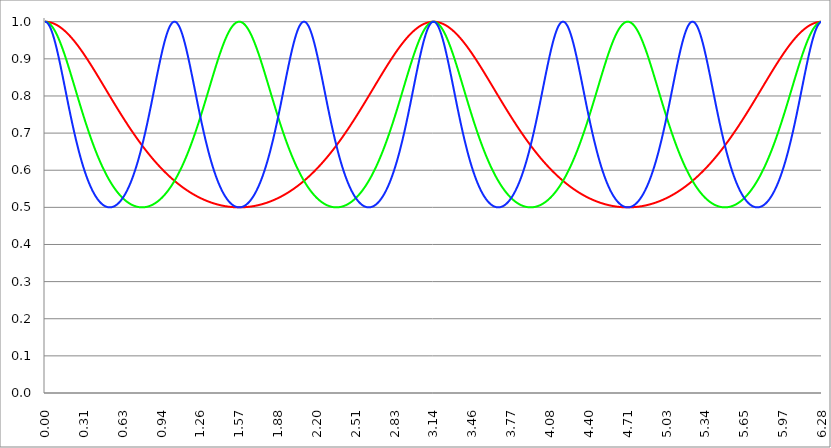
| Category | Series 1 | Series 0 | Series 2 |
|---|---|---|---|
| 0.0 | 1 | 1 | 1 |
| 0.00314159265358979 | 1 | 1 | 1 |
| 0.00628318530717958 | 1 | 1 | 1 |
| 0.00942477796076938 | 1 | 1 | 0.999 |
| 0.0125663706143592 | 1 | 0.999 | 0.999 |
| 0.015707963267949 | 1 | 0.999 | 0.998 |
| 0.0188495559215388 | 1 | 0.999 | 0.997 |
| 0.0219911485751285 | 1 | 0.998 | 0.996 |
| 0.0251327412287183 | 0.999 | 0.997 | 0.994 |
| 0.0282743338823081 | 0.999 | 0.997 | 0.993 |
| 0.0314159265358979 | 0.999 | 0.996 | 0.991 |
| 0.0345575191894877 | 0.999 | 0.995 | 0.989 |
| 0.0376991118430775 | 0.999 | 0.994 | 0.987 |
| 0.0408407044966673 | 0.998 | 0.993 | 0.985 |
| 0.0439822971502571 | 0.998 | 0.992 | 0.983 |
| 0.0471238898038469 | 0.998 | 0.991 | 0.981 |
| 0.0502654824574367 | 0.997 | 0.99 | 0.978 |
| 0.0534070751110265 | 0.997 | 0.989 | 0.975 |
| 0.0565486677646163 | 0.997 | 0.987 | 0.972 |
| 0.059690260418206 | 0.996 | 0.986 | 0.969 |
| 0.0628318530717958 | 0.996 | 0.985 | 0.966 |
| 0.0659734457253856 | 0.996 | 0.983 | 0.963 |
| 0.0691150383789754 | 0.995 | 0.981 | 0.959 |
| 0.0722566310325652 | 0.995 | 0.98 | 0.956 |
| 0.075398223686155 | 0.994 | 0.978 | 0.952 |
| 0.0785398163397448 | 0.994 | 0.976 | 0.948 |
| 0.0816814089933346 | 0.993 | 0.974 | 0.944 |
| 0.0848230016469244 | 0.993 | 0.972 | 0.94 |
| 0.0879645943005142 | 0.992 | 0.97 | 0.936 |
| 0.091106186954104 | 0.992 | 0.968 | 0.932 |
| 0.0942477796076937 | 0.991 | 0.966 | 0.928 |
| 0.0973893722612835 | 0.991 | 0.964 | 0.923 |
| 0.100530964914873 | 0.99 | 0.962 | 0.919 |
| 0.103672557568463 | 0.989 | 0.959 | 0.914 |
| 0.106814150222053 | 0.989 | 0.957 | 0.91 |
| 0.109955742875643 | 0.988 | 0.955 | 0.905 |
| 0.113097335529233 | 0.987 | 0.952 | 0.9 |
| 0.116238928182822 | 0.987 | 0.95 | 0.895 |
| 0.119380520836412 | 0.986 | 0.947 | 0.891 |
| 0.122522113490002 | 0.985 | 0.944 | 0.886 |
| 0.125663706143592 | 0.985 | 0.942 | 0.881 |
| 0.128805298797181 | 0.984 | 0.939 | 0.876 |
| 0.131946891450771 | 0.983 | 0.936 | 0.871 |
| 0.135088484104361 | 0.982 | 0.934 | 0.865 |
| 0.138230076757951 | 0.981 | 0.931 | 0.86 |
| 0.141371669411541 | 0.981 | 0.928 | 0.855 |
| 0.14451326206513 | 0.98 | 0.925 | 0.85 |
| 0.14765485471872 | 0.979 | 0.922 | 0.845 |
| 0.15079644737231 | 0.978 | 0.919 | 0.84 |
| 0.1539380400259 | 0.977 | 0.916 | 0.834 |
| 0.15707963267949 | 0.976 | 0.913 | 0.829 |
| 0.160221225333079 | 0.975 | 0.91 | 0.824 |
| 0.163362817986669 | 0.974 | 0.907 | 0.819 |
| 0.166504410640259 | 0.973 | 0.903 | 0.813 |
| 0.169646003293849 | 0.972 | 0.9 | 0.808 |
| 0.172787595947439 | 0.971 | 0.897 | 0.803 |
| 0.175929188601028 | 0.97 | 0.894 | 0.798 |
| 0.179070781254618 | 0.969 | 0.891 | 0.792 |
| 0.182212373908208 | 0.968 | 0.887 | 0.787 |
| 0.185353966561798 | 0.967 | 0.884 | 0.782 |
| 0.188495559215388 | 0.966 | 0.881 | 0.777 |
| 0.191637151868977 | 0.965 | 0.877 | 0.772 |
| 0.194778744522567 | 0.964 | 0.874 | 0.767 |
| 0.197920337176157 | 0.963 | 0.871 | 0.762 |
| 0.201061929829747 | 0.962 | 0.867 | 0.757 |
| 0.204203522483336 | 0.961 | 0.864 | 0.752 |
| 0.207345115136926 | 0.959 | 0.86 | 0.747 |
| 0.210486707790516 | 0.958 | 0.857 | 0.742 |
| 0.213628300444106 | 0.957 | 0.853 | 0.737 |
| 0.216769893097696 | 0.956 | 0.85 | 0.732 |
| 0.219911485751285 | 0.955 | 0.847 | 0.727 |
| 0.223053078404875 | 0.953 | 0.843 | 0.722 |
| 0.226194671058465 | 0.952 | 0.84 | 0.717 |
| 0.229336263712055 | 0.951 | 0.836 | 0.713 |
| 0.232477856365645 | 0.95 | 0.833 | 0.708 |
| 0.235619449019234 | 0.948 | 0.829 | 0.703 |
| 0.238761041672824 | 0.947 | 0.826 | 0.699 |
| 0.241902634326414 | 0.946 | 0.822 | 0.694 |
| 0.245044226980004 | 0.944 | 0.819 | 0.69 |
| 0.248185819633594 | 0.943 | 0.815 | 0.685 |
| 0.251327412287183 | 0.942 | 0.812 | 0.681 |
| 0.254469004940773 | 0.94 | 0.808 | 0.677 |
| 0.257610597594363 | 0.939 | 0.805 | 0.672 |
| 0.260752190247953 | 0.938 | 0.801 | 0.668 |
| 0.263893782901543 | 0.936 | 0.798 | 0.664 |
| 0.267035375555132 | 0.935 | 0.794 | 0.66 |
| 0.270176968208722 | 0.934 | 0.791 | 0.656 |
| 0.273318560862312 | 0.932 | 0.787 | 0.652 |
| 0.276460153515902 | 0.931 | 0.784 | 0.648 |
| 0.279601746169492 | 0.929 | 0.78 | 0.644 |
| 0.282743338823082 | 0.928 | 0.777 | 0.64 |
| 0.285884931476671 | 0.926 | 0.774 | 0.636 |
| 0.289026524130261 | 0.925 | 0.77 | 0.632 |
| 0.292168116783851 | 0.923 | 0.767 | 0.629 |
| 0.295309709437441 | 0.922 | 0.763 | 0.625 |
| 0.298451302091031 | 0.92 | 0.76 | 0.621 |
| 0.30159289474462 | 0.919 | 0.757 | 0.618 |
| 0.30473448739821 | 0.917 | 0.753 | 0.614 |
| 0.3078760800518 | 0.916 | 0.75 | 0.611 |
| 0.31101767270539 | 0.914 | 0.747 | 0.608 |
| 0.31415926535898 | 0.913 | 0.743 | 0.604 |
| 0.31730085801257 | 0.911 | 0.74 | 0.601 |
| 0.320442450666159 | 0.91 | 0.737 | 0.598 |
| 0.323584043319749 | 0.908 | 0.733 | 0.595 |
| 0.326725635973339 | 0.907 | 0.73 | 0.592 |
| 0.329867228626929 | 0.905 | 0.727 | 0.589 |
| 0.333008821280519 | 0.903 | 0.724 | 0.586 |
| 0.336150413934108 | 0.902 | 0.721 | 0.583 |
| 0.339292006587698 | 0.9 | 0.717 | 0.58 |
| 0.342433599241288 | 0.899 | 0.714 | 0.577 |
| 0.345575191894878 | 0.897 | 0.711 | 0.574 |
| 0.348716784548468 | 0.895 | 0.708 | 0.572 |
| 0.351858377202058 | 0.894 | 0.705 | 0.569 |
| 0.354999969855647 | 0.892 | 0.702 | 0.566 |
| 0.358141562509237 | 0.891 | 0.699 | 0.564 |
| 0.361283155162827 | 0.889 | 0.696 | 0.561 |
| 0.364424747816417 | 0.887 | 0.693 | 0.559 |
| 0.367566340470007 | 0.886 | 0.69 | 0.557 |
| 0.370707933123597 | 0.884 | 0.687 | 0.554 |
| 0.373849525777186 | 0.882 | 0.684 | 0.552 |
| 0.376991118430776 | 0.881 | 0.681 | 0.55 |
| 0.380132711084366 | 0.879 | 0.678 | 0.548 |
| 0.383274303737956 | 0.877 | 0.675 | 0.546 |
| 0.386415896391546 | 0.876 | 0.672 | 0.543 |
| 0.389557489045135 | 0.874 | 0.669 | 0.541 |
| 0.392699081698725 | 0.872 | 0.667 | 0.54 |
| 0.395840674352315 | 0.871 | 0.664 | 0.538 |
| 0.398982267005905 | 0.869 | 0.661 | 0.536 |
| 0.402123859659495 | 0.867 | 0.658 | 0.534 |
| 0.405265452313085 | 0.865 | 0.656 | 0.532 |
| 0.408407044966674 | 0.864 | 0.653 | 0.53 |
| 0.411548637620264 | 0.862 | 0.65 | 0.529 |
| 0.414690230273854 | 0.86 | 0.648 | 0.527 |
| 0.417831822927444 | 0.859 | 0.645 | 0.526 |
| 0.420973415581034 | 0.857 | 0.642 | 0.524 |
| 0.424115008234623 | 0.855 | 0.64 | 0.523 |
| 0.427256600888213 | 0.853 | 0.637 | 0.521 |
| 0.430398193541803 | 0.852 | 0.635 | 0.52 |
| 0.433539786195393 | 0.85 | 0.632 | 0.518 |
| 0.436681378848983 | 0.848 | 0.63 | 0.517 |
| 0.439822971502573 | 0.847 | 0.627 | 0.516 |
| 0.442964564156162 | 0.845 | 0.625 | 0.515 |
| 0.446106156809752 | 0.843 | 0.623 | 0.514 |
| 0.449247749463342 | 0.841 | 0.62 | 0.513 |
| 0.452389342116932 | 0.84 | 0.618 | 0.511 |
| 0.455530934770522 | 0.838 | 0.616 | 0.51 |
| 0.458672527424111 | 0.836 | 0.613 | 0.51 |
| 0.461814120077701 | 0.834 | 0.611 | 0.509 |
| 0.464955712731291 | 0.833 | 0.609 | 0.508 |
| 0.468097305384881 | 0.831 | 0.607 | 0.507 |
| 0.471238898038471 | 0.829 | 0.604 | 0.506 |
| 0.474380490692061 | 0.827 | 0.602 | 0.505 |
| 0.47752208334565 | 0.826 | 0.6 | 0.505 |
| 0.48066367599924 | 0.824 | 0.598 | 0.504 |
| 0.48380526865283 | 0.822 | 0.596 | 0.504 |
| 0.48694686130642 | 0.82 | 0.594 | 0.503 |
| 0.49008845396001 | 0.819 | 0.592 | 0.503 |
| 0.493230046613599 | 0.817 | 0.59 | 0.502 |
| 0.496371639267189 | 0.815 | 0.588 | 0.502 |
| 0.499513231920779 | 0.813 | 0.586 | 0.501 |
| 0.502654824574369 | 0.812 | 0.584 | 0.501 |
| 0.505796417227959 | 0.81 | 0.582 | 0.501 |
| 0.508938009881549 | 0.808 | 0.58 | 0.5 |
| 0.512079602535138 | 0.806 | 0.578 | 0.5 |
| 0.515221195188728 | 0.805 | 0.576 | 0.5 |
| 0.518362787842318 | 0.803 | 0.574 | 0.5 |
| 0.521504380495908 | 0.801 | 0.573 | 0.5 |
| 0.524645973149498 | 0.799 | 0.571 | 0.5 |
| 0.527787565803087 | 0.798 | 0.569 | 0.5 |
| 0.530929158456677 | 0.796 | 0.567 | 0.5 |
| 0.534070751110267 | 0.794 | 0.566 | 0.5 |
| 0.537212343763857 | 0.792 | 0.564 | 0.5 |
| 0.540353936417447 | 0.791 | 0.562 | 0.501 |
| 0.543495529071037 | 0.789 | 0.561 | 0.501 |
| 0.546637121724626 | 0.787 | 0.559 | 0.501 |
| 0.549778714378216 | 0.786 | 0.557 | 0.502 |
| 0.552920307031806 | 0.784 | 0.556 | 0.502 |
| 0.556061899685396 | 0.782 | 0.554 | 0.502 |
| 0.559203492338986 | 0.78 | 0.553 | 0.503 |
| 0.562345084992576 | 0.779 | 0.551 | 0.503 |
| 0.565486677646165 | 0.777 | 0.55 | 0.504 |
| 0.568628270299755 | 0.775 | 0.548 | 0.505 |
| 0.571769862953345 | 0.774 | 0.547 | 0.505 |
| 0.574911455606935 | 0.772 | 0.546 | 0.506 |
| 0.578053048260525 | 0.77 | 0.544 | 0.507 |
| 0.581194640914114 | 0.768 | 0.543 | 0.508 |
| 0.584336233567704 | 0.767 | 0.541 | 0.508 |
| 0.587477826221294 | 0.765 | 0.54 | 0.509 |
| 0.590619418874884 | 0.763 | 0.539 | 0.51 |
| 0.593761011528474 | 0.762 | 0.538 | 0.511 |
| 0.596902604182064 | 0.76 | 0.536 | 0.512 |
| 0.600044196835653 | 0.758 | 0.535 | 0.513 |
| 0.603185789489243 | 0.757 | 0.534 | 0.514 |
| 0.606327382142833 | 0.755 | 0.533 | 0.516 |
| 0.609468974796423 | 0.753 | 0.532 | 0.517 |
| 0.612610567450013 | 0.752 | 0.53 | 0.518 |
| 0.615752160103602 | 0.75 | 0.529 | 0.519 |
| 0.618893752757192 | 0.748 | 0.528 | 0.521 |
| 0.622035345410782 | 0.747 | 0.527 | 0.522 |
| 0.625176938064372 | 0.745 | 0.526 | 0.524 |
| 0.628318530717962 | 0.743 | 0.525 | 0.525 |
| 0.631460123371551 | 0.742 | 0.524 | 0.527 |
| 0.634601716025141 | 0.74 | 0.523 | 0.528 |
| 0.637743308678731 | 0.738 | 0.522 | 0.53 |
| 0.640884901332321 | 0.737 | 0.521 | 0.532 |
| 0.644026493985911 | 0.735 | 0.52 | 0.533 |
| 0.647168086639501 | 0.733 | 0.519 | 0.535 |
| 0.65030967929309 | 0.732 | 0.518 | 0.537 |
| 0.65345127194668 | 0.73 | 0.518 | 0.539 |
| 0.65659286460027 | 0.729 | 0.517 | 0.541 |
| 0.65973445725386 | 0.727 | 0.516 | 0.543 |
| 0.66287604990745 | 0.725 | 0.515 | 0.545 |
| 0.666017642561039 | 0.724 | 0.514 | 0.547 |
| 0.669159235214629 | 0.722 | 0.514 | 0.549 |
| 0.672300827868219 | 0.721 | 0.513 | 0.551 |
| 0.675442420521809 | 0.719 | 0.512 | 0.554 |
| 0.678584013175399 | 0.717 | 0.511 | 0.556 |
| 0.681725605828989 | 0.716 | 0.511 | 0.558 |
| 0.684867198482578 | 0.714 | 0.51 | 0.561 |
| 0.688008791136168 | 0.713 | 0.51 | 0.563 |
| 0.691150383789758 | 0.711 | 0.509 | 0.566 |
| 0.694291976443348 | 0.71 | 0.508 | 0.568 |
| 0.697433569096938 | 0.708 | 0.508 | 0.571 |
| 0.700575161750528 | 0.706 | 0.507 | 0.574 |
| 0.703716754404117 | 0.705 | 0.507 | 0.576 |
| 0.706858347057707 | 0.703 | 0.506 | 0.579 |
| 0.709999939711297 | 0.702 | 0.506 | 0.582 |
| 0.713141532364887 | 0.7 | 0.505 | 0.585 |
| 0.716283125018477 | 0.699 | 0.505 | 0.588 |
| 0.719424717672066 | 0.697 | 0.504 | 0.591 |
| 0.722566310325656 | 0.696 | 0.504 | 0.594 |
| 0.725707902979246 | 0.694 | 0.504 | 0.597 |
| 0.728849495632836 | 0.693 | 0.503 | 0.6 |
| 0.731991088286426 | 0.691 | 0.503 | 0.603 |
| 0.735132680940016 | 0.69 | 0.503 | 0.607 |
| 0.738274273593605 | 0.688 | 0.502 | 0.61 |
| 0.741415866247195 | 0.687 | 0.502 | 0.613 |
| 0.744557458900785 | 0.685 | 0.502 | 0.617 |
| 0.747699051554375 | 0.684 | 0.501 | 0.62 |
| 0.750840644207965 | 0.682 | 0.501 | 0.624 |
| 0.753982236861554 | 0.681 | 0.501 | 0.627 |
| 0.757123829515144 | 0.679 | 0.501 | 0.631 |
| 0.760265422168734 | 0.678 | 0.501 | 0.635 |
| 0.763407014822324 | 0.677 | 0.5 | 0.639 |
| 0.766548607475914 | 0.675 | 0.5 | 0.642 |
| 0.769690200129504 | 0.674 | 0.5 | 0.646 |
| 0.772831792783093 | 0.672 | 0.5 | 0.65 |
| 0.775973385436683 | 0.671 | 0.5 | 0.654 |
| 0.779114978090273 | 0.669 | 0.5 | 0.658 |
| 0.782256570743863 | 0.668 | 0.5 | 0.663 |
| 0.785398163397453 | 0.667 | 0.5 | 0.667 |
| 0.788539756051042 | 0.665 | 0.5 | 0.671 |
| 0.791681348704632 | 0.664 | 0.5 | 0.675 |
| 0.794822941358222 | 0.663 | 0.5 | 0.679 |
| 0.797964534011812 | 0.661 | 0.5 | 0.684 |
| 0.801106126665402 | 0.66 | 0.5 | 0.688 |
| 0.804247719318992 | 0.658 | 0.5 | 0.693 |
| 0.807389311972581 | 0.657 | 0.5 | 0.697 |
| 0.810530904626171 | 0.656 | 0.501 | 0.702 |
| 0.813672497279761 | 0.654 | 0.501 | 0.706 |
| 0.816814089933351 | 0.653 | 0.501 | 0.711 |
| 0.819955682586941 | 0.652 | 0.501 | 0.716 |
| 0.823097275240531 | 0.65 | 0.501 | 0.721 |
| 0.82623886789412 | 0.649 | 0.502 | 0.725 |
| 0.82938046054771 | 0.648 | 0.502 | 0.73 |
| 0.8325220532013 | 0.646 | 0.502 | 0.735 |
| 0.83566364585489 | 0.645 | 0.503 | 0.74 |
| 0.83880523850848 | 0.644 | 0.503 | 0.745 |
| 0.841946831162069 | 0.642 | 0.503 | 0.75 |
| 0.845088423815659 | 0.641 | 0.504 | 0.755 |
| 0.848230016469249 | 0.64 | 0.504 | 0.76 |
| 0.851371609122839 | 0.639 | 0.504 | 0.765 |
| 0.854513201776429 | 0.637 | 0.505 | 0.77 |
| 0.857654794430019 | 0.636 | 0.505 | 0.775 |
| 0.860796387083608 | 0.635 | 0.506 | 0.78 |
| 0.863937979737198 | 0.634 | 0.506 | 0.786 |
| 0.867079572390788 | 0.632 | 0.507 | 0.791 |
| 0.870221165044378 | 0.631 | 0.507 | 0.796 |
| 0.873362757697968 | 0.63 | 0.508 | 0.801 |
| 0.876504350351557 | 0.629 | 0.508 | 0.806 |
| 0.879645943005147 | 0.627 | 0.509 | 0.812 |
| 0.882787535658737 | 0.626 | 0.51 | 0.817 |
| 0.885929128312327 | 0.625 | 0.51 | 0.822 |
| 0.889070720965917 | 0.624 | 0.511 | 0.827 |
| 0.892212313619507 | 0.623 | 0.511 | 0.833 |
| 0.895353906273096 | 0.621 | 0.512 | 0.838 |
| 0.898495498926686 | 0.62 | 0.513 | 0.843 |
| 0.901637091580276 | 0.619 | 0.514 | 0.848 |
| 0.904778684233866 | 0.618 | 0.514 | 0.853 |
| 0.907920276887456 | 0.617 | 0.515 | 0.859 |
| 0.911061869541045 | 0.616 | 0.516 | 0.864 |
| 0.914203462194635 | 0.614 | 0.517 | 0.869 |
| 0.917345054848225 | 0.613 | 0.518 | 0.874 |
| 0.920486647501815 | 0.612 | 0.518 | 0.879 |
| 0.923628240155405 | 0.611 | 0.519 | 0.884 |
| 0.926769832808995 | 0.61 | 0.52 | 0.889 |
| 0.929911425462584 | 0.609 | 0.521 | 0.894 |
| 0.933053018116174 | 0.608 | 0.522 | 0.899 |
| 0.936194610769764 | 0.607 | 0.523 | 0.903 |
| 0.939336203423354 | 0.606 | 0.524 | 0.908 |
| 0.942477796076944 | 0.604 | 0.525 | 0.913 |
| 0.945619388730533 | 0.603 | 0.526 | 0.917 |
| 0.948760981384123 | 0.602 | 0.527 | 0.922 |
| 0.951902574037713 | 0.601 | 0.528 | 0.926 |
| 0.955044166691303 | 0.6 | 0.529 | 0.931 |
| 0.958185759344893 | 0.599 | 0.53 | 0.935 |
| 0.961327351998483 | 0.598 | 0.532 | 0.939 |
| 0.964468944652072 | 0.597 | 0.533 | 0.943 |
| 0.967610537305662 | 0.596 | 0.534 | 0.947 |
| 0.970752129959252 | 0.595 | 0.535 | 0.951 |
| 0.973893722612842 | 0.594 | 0.536 | 0.955 |
| 0.977035315266432 | 0.593 | 0.538 | 0.958 |
| 0.980176907920022 | 0.592 | 0.539 | 0.962 |
| 0.983318500573611 | 0.591 | 0.54 | 0.965 |
| 0.986460093227201 | 0.59 | 0.541 | 0.968 |
| 0.989601685880791 | 0.589 | 0.543 | 0.971 |
| 0.992743278534381 | 0.588 | 0.544 | 0.974 |
| 0.995884871187971 | 0.587 | 0.546 | 0.977 |
| 0.99902646384156 | 0.586 | 0.547 | 0.98 |
| 1.00216805649515 | 0.585 | 0.548 | 0.982 |
| 1.00530964914874 | 0.584 | 0.55 | 0.985 |
| 1.00845124180233 | 0.583 | 0.551 | 0.987 |
| 1.01159283445592 | 0.582 | 0.553 | 0.989 |
| 1.01473442710951 | 0.581 | 0.554 | 0.991 |
| 1.017876019763099 | 0.58 | 0.556 | 0.992 |
| 1.021017612416689 | 0.579 | 0.557 | 0.994 |
| 1.02415920507028 | 0.578 | 0.559 | 0.995 |
| 1.027300797723869 | 0.577 | 0.561 | 0.996 |
| 1.030442390377459 | 0.576 | 0.562 | 0.997 |
| 1.033583983031048 | 0.575 | 0.564 | 0.998 |
| 1.036725575684638 | 0.574 | 0.566 | 0.999 |
| 1.039867168338228 | 0.574 | 0.567 | 1 |
| 1.043008760991818 | 0.573 | 0.569 | 1 |
| 1.046150353645408 | 0.572 | 0.571 | 1 |
| 1.049291946298998 | 0.571 | 0.573 | 1 |
| 1.052433538952587 | 0.57 | 0.574 | 1 |
| 1.055575131606177 | 0.569 | 0.576 | 0.999 |
| 1.058716724259767 | 0.568 | 0.578 | 0.999 |
| 1.061858316913357 | 0.567 | 0.58 | 0.998 |
| 1.064999909566947 | 0.566 | 0.582 | 0.997 |
| 1.068141502220536 | 0.566 | 0.584 | 0.996 |
| 1.071283094874126 | 0.565 | 0.586 | 0.995 |
| 1.074424687527716 | 0.564 | 0.588 | 0.993 |
| 1.077566280181306 | 0.563 | 0.59 | 0.992 |
| 1.080707872834896 | 0.562 | 0.592 | 0.99 |
| 1.083849465488486 | 0.561 | 0.594 | 0.988 |
| 1.086991058142075 | 0.561 | 0.596 | 0.986 |
| 1.090132650795665 | 0.56 | 0.598 | 0.984 |
| 1.093274243449255 | 0.559 | 0.6 | 0.981 |
| 1.096415836102845 | 0.558 | 0.602 | 0.979 |
| 1.099557428756435 | 0.557 | 0.604 | 0.976 |
| 1.102699021410025 | 0.557 | 0.607 | 0.973 |
| 1.105840614063614 | 0.556 | 0.609 | 0.97 |
| 1.108982206717204 | 0.555 | 0.611 | 0.967 |
| 1.112123799370794 | 0.554 | 0.613 | 0.964 |
| 1.115265392024384 | 0.554 | 0.616 | 0.961 |
| 1.118406984677974 | 0.553 | 0.618 | 0.957 |
| 1.121548577331563 | 0.552 | 0.62 | 0.953 |
| 1.124690169985153 | 0.551 | 0.623 | 0.95 |
| 1.127831762638743 | 0.551 | 0.625 | 0.946 |
| 1.130973355292333 | 0.55 | 0.627 | 0.942 |
| 1.134114947945923 | 0.549 | 0.63 | 0.938 |
| 1.137256540599513 | 0.548 | 0.632 | 0.934 |
| 1.140398133253102 | 0.548 | 0.635 | 0.929 |
| 1.143539725906692 | 0.547 | 0.637 | 0.925 |
| 1.146681318560282 | 0.546 | 0.64 | 0.92 |
| 1.149822911213872 | 0.546 | 0.642 | 0.916 |
| 1.152964503867462 | 0.545 | 0.645 | 0.911 |
| 1.156106096521051 | 0.544 | 0.648 | 0.907 |
| 1.159247689174641 | 0.543 | 0.65 | 0.902 |
| 1.162389281828231 | 0.543 | 0.653 | 0.897 |
| 1.165530874481821 | 0.542 | 0.656 | 0.892 |
| 1.168672467135411 | 0.541 | 0.658 | 0.887 |
| 1.171814059789001 | 0.541 | 0.661 | 0.882 |
| 1.17495565244259 | 0.54 | 0.664 | 0.877 |
| 1.17809724509618 | 0.54 | 0.667 | 0.872 |
| 1.18123883774977 | 0.539 | 0.669 | 0.867 |
| 1.18438043040336 | 0.538 | 0.672 | 0.862 |
| 1.18752202305695 | 0.538 | 0.675 | 0.857 |
| 1.190663615710539 | 0.537 | 0.678 | 0.852 |
| 1.193805208364129 | 0.536 | 0.681 | 0.847 |
| 1.19694680101772 | 0.536 | 0.684 | 0.841 |
| 1.200088393671309 | 0.535 | 0.687 | 0.836 |
| 1.203229986324899 | 0.535 | 0.69 | 0.831 |
| 1.206371578978489 | 0.534 | 0.693 | 0.826 |
| 1.209513171632078 | 0.533 | 0.696 | 0.82 |
| 1.212654764285668 | 0.533 | 0.699 | 0.815 |
| 1.215796356939258 | 0.532 | 0.702 | 0.81 |
| 1.218937949592848 | 0.532 | 0.705 | 0.805 |
| 1.222079542246438 | 0.531 | 0.708 | 0.799 |
| 1.225221134900027 | 0.53 | 0.711 | 0.794 |
| 1.228362727553617 | 0.53 | 0.714 | 0.789 |
| 1.231504320207207 | 0.529 | 0.717 | 0.784 |
| 1.234645912860797 | 0.529 | 0.721 | 0.779 |
| 1.237787505514387 | 0.528 | 0.724 | 0.774 |
| 1.240929098167977 | 0.528 | 0.727 | 0.768 |
| 1.244070690821566 | 0.527 | 0.73 | 0.763 |
| 1.247212283475156 | 0.527 | 0.733 | 0.758 |
| 1.250353876128746 | 0.526 | 0.737 | 0.753 |
| 1.253495468782336 | 0.526 | 0.74 | 0.748 |
| 1.256637061435926 | 0.525 | 0.743 | 0.743 |
| 1.259778654089515 | 0.525 | 0.747 | 0.738 |
| 1.262920246743105 | 0.524 | 0.75 | 0.733 |
| 1.266061839396695 | 0.524 | 0.753 | 0.729 |
| 1.269203432050285 | 0.523 | 0.757 | 0.724 |
| 1.272345024703875 | 0.523 | 0.76 | 0.719 |
| 1.275486617357465 | 0.522 | 0.763 | 0.714 |
| 1.278628210011054 | 0.522 | 0.767 | 0.71 |
| 1.281769802664644 | 0.521 | 0.77 | 0.705 |
| 1.284911395318234 | 0.521 | 0.774 | 0.7 |
| 1.288052987971824 | 0.52 | 0.777 | 0.696 |
| 1.291194580625414 | 0.52 | 0.78 | 0.691 |
| 1.294336173279003 | 0.519 | 0.784 | 0.687 |
| 1.297477765932593 | 0.519 | 0.787 | 0.682 |
| 1.300619358586183 | 0.518 | 0.791 | 0.678 |
| 1.303760951239773 | 0.518 | 0.794 | 0.674 |
| 1.306902543893363 | 0.518 | 0.798 | 0.669 |
| 1.310044136546953 | 0.517 | 0.801 | 0.665 |
| 1.313185729200542 | 0.517 | 0.805 | 0.661 |
| 1.316327321854132 | 0.516 | 0.808 | 0.657 |
| 1.319468914507722 | 0.516 | 0.812 | 0.653 |
| 1.322610507161312 | 0.516 | 0.815 | 0.649 |
| 1.325752099814902 | 0.515 | 0.819 | 0.645 |
| 1.328893692468491 | 0.515 | 0.822 | 0.641 |
| 1.332035285122081 | 0.514 | 0.826 | 0.637 |
| 1.335176877775671 | 0.514 | 0.829 | 0.634 |
| 1.338318470429261 | 0.514 | 0.833 | 0.63 |
| 1.341460063082851 | 0.513 | 0.836 | 0.626 |
| 1.344601655736441 | 0.513 | 0.84 | 0.623 |
| 1.34774324839003 | 0.513 | 0.843 | 0.619 |
| 1.35088484104362 | 0.512 | 0.847 | 0.616 |
| 1.35402643369721 | 0.512 | 0.85 | 0.612 |
| 1.3571680263508 | 0.511 | 0.853 | 0.609 |
| 1.36030961900439 | 0.511 | 0.857 | 0.606 |
| 1.363451211657979 | 0.511 | 0.86 | 0.602 |
| 1.36659280431157 | 0.51 | 0.864 | 0.599 |
| 1.369734396965159 | 0.51 | 0.867 | 0.596 |
| 1.372875989618749 | 0.51 | 0.871 | 0.593 |
| 1.376017582272339 | 0.51 | 0.874 | 0.59 |
| 1.379159174925929 | 0.509 | 0.877 | 0.587 |
| 1.382300767579518 | 0.509 | 0.881 | 0.584 |
| 1.385442360233108 | 0.509 | 0.884 | 0.581 |
| 1.388583952886698 | 0.508 | 0.887 | 0.578 |
| 1.391725545540288 | 0.508 | 0.891 | 0.575 |
| 1.394867138193878 | 0.508 | 0.894 | 0.573 |
| 1.398008730847468 | 0.508 | 0.897 | 0.57 |
| 1.401150323501057 | 0.507 | 0.9 | 0.567 |
| 1.404291916154647 | 0.507 | 0.903 | 0.565 |
| 1.407433508808237 | 0.507 | 0.907 | 0.562 |
| 1.410575101461827 | 0.506 | 0.91 | 0.56 |
| 1.413716694115417 | 0.506 | 0.913 | 0.557 |
| 1.416858286769006 | 0.506 | 0.916 | 0.555 |
| 1.419999879422596 | 0.506 | 0.919 | 0.553 |
| 1.423141472076186 | 0.505 | 0.922 | 0.551 |
| 1.426283064729776 | 0.505 | 0.925 | 0.548 |
| 1.429424657383366 | 0.505 | 0.928 | 0.546 |
| 1.432566250036956 | 0.505 | 0.931 | 0.544 |
| 1.435707842690545 | 0.505 | 0.934 | 0.542 |
| 1.438849435344135 | 0.504 | 0.936 | 0.54 |
| 1.441991027997725 | 0.504 | 0.939 | 0.538 |
| 1.445132620651315 | 0.504 | 0.942 | 0.536 |
| 1.448274213304905 | 0.504 | 0.944 | 0.535 |
| 1.451415805958494 | 0.504 | 0.947 | 0.533 |
| 1.454557398612084 | 0.503 | 0.95 | 0.531 |
| 1.457698991265674 | 0.503 | 0.952 | 0.529 |
| 1.460840583919264 | 0.503 | 0.955 | 0.528 |
| 1.463982176572854 | 0.503 | 0.957 | 0.526 |
| 1.467123769226444 | 0.503 | 0.959 | 0.525 |
| 1.470265361880033 | 0.503 | 0.962 | 0.523 |
| 1.473406954533623 | 0.502 | 0.964 | 0.522 |
| 1.476548547187213 | 0.502 | 0.966 | 0.52 |
| 1.479690139840803 | 0.502 | 0.968 | 0.519 |
| 1.482831732494393 | 0.502 | 0.97 | 0.518 |
| 1.485973325147982 | 0.502 | 0.972 | 0.516 |
| 1.489114917801572 | 0.502 | 0.974 | 0.515 |
| 1.492256510455162 | 0.502 | 0.976 | 0.514 |
| 1.495398103108752 | 0.501 | 0.978 | 0.513 |
| 1.498539695762342 | 0.501 | 0.98 | 0.512 |
| 1.501681288415932 | 0.501 | 0.981 | 0.511 |
| 1.504822881069521 | 0.501 | 0.983 | 0.51 |
| 1.507964473723111 | 0.501 | 0.985 | 0.509 |
| 1.511106066376701 | 0.501 | 0.986 | 0.508 |
| 1.514247659030291 | 0.501 | 0.987 | 0.507 |
| 1.517389251683881 | 0.501 | 0.989 | 0.506 |
| 1.520530844337471 | 0.501 | 0.99 | 0.506 |
| 1.52367243699106 | 0.501 | 0.991 | 0.505 |
| 1.52681402964465 | 0.5 | 0.992 | 0.504 |
| 1.52995562229824 | 0.5 | 0.993 | 0.504 |
| 1.53309721495183 | 0.5 | 0.994 | 0.503 |
| 1.53623880760542 | 0.5 | 0.995 | 0.503 |
| 1.539380400259009 | 0.5 | 0.996 | 0.502 |
| 1.542521992912599 | 0.5 | 0.997 | 0.502 |
| 1.545663585566189 | 0.5 | 0.997 | 0.501 |
| 1.548805178219779 | 0.5 | 0.998 | 0.501 |
| 1.551946770873369 | 0.5 | 0.999 | 0.501 |
| 1.555088363526959 | 0.5 | 0.999 | 0.501 |
| 1.558229956180548 | 0.5 | 0.999 | 0.5 |
| 1.561371548834138 | 0.5 | 1 | 0.5 |
| 1.564513141487728 | 0.5 | 1 | 0.5 |
| 1.567654734141318 | 0.5 | 1 | 0.5 |
| 1.570796326794908 | 0.5 | 1 | 0.5 |
| 1.573937919448497 | 0.5 | 1 | 0.5 |
| 1.577079512102087 | 0.5 | 1 | 0.5 |
| 1.580221104755677 | 0.5 | 1 | 0.5 |
| 1.583362697409267 | 0.5 | 0.999 | 0.5 |
| 1.586504290062857 | 0.5 | 0.999 | 0.501 |
| 1.589645882716447 | 0.5 | 0.999 | 0.501 |
| 1.592787475370036 | 0.5 | 0.998 | 0.501 |
| 1.595929068023626 | 0.5 | 0.997 | 0.501 |
| 1.599070660677216 | 0.5 | 0.997 | 0.502 |
| 1.602212253330806 | 0.5 | 0.996 | 0.502 |
| 1.605353845984396 | 0.5 | 0.995 | 0.503 |
| 1.608495438637985 | 0.5 | 0.994 | 0.503 |
| 1.611637031291575 | 0.5 | 0.993 | 0.504 |
| 1.614778623945165 | 0.5 | 0.992 | 0.504 |
| 1.617920216598755 | 0.501 | 0.991 | 0.505 |
| 1.621061809252345 | 0.501 | 0.99 | 0.506 |
| 1.624203401905935 | 0.501 | 0.989 | 0.506 |
| 1.627344994559524 | 0.501 | 0.987 | 0.507 |
| 1.630486587213114 | 0.501 | 0.986 | 0.508 |
| 1.633628179866704 | 0.501 | 0.985 | 0.509 |
| 1.636769772520294 | 0.501 | 0.983 | 0.51 |
| 1.639911365173884 | 0.501 | 0.981 | 0.511 |
| 1.643052957827473 | 0.501 | 0.98 | 0.512 |
| 1.646194550481063 | 0.501 | 0.978 | 0.513 |
| 1.649336143134653 | 0.502 | 0.976 | 0.514 |
| 1.652477735788243 | 0.502 | 0.974 | 0.515 |
| 1.655619328441833 | 0.502 | 0.972 | 0.516 |
| 1.658760921095423 | 0.502 | 0.97 | 0.518 |
| 1.661902513749012 | 0.502 | 0.968 | 0.519 |
| 1.665044106402602 | 0.502 | 0.966 | 0.52 |
| 1.668185699056192 | 0.502 | 0.964 | 0.522 |
| 1.671327291709782 | 0.503 | 0.962 | 0.523 |
| 1.674468884363372 | 0.503 | 0.959 | 0.525 |
| 1.677610477016961 | 0.503 | 0.957 | 0.526 |
| 1.680752069670551 | 0.503 | 0.955 | 0.528 |
| 1.683893662324141 | 0.503 | 0.952 | 0.529 |
| 1.687035254977731 | 0.503 | 0.95 | 0.531 |
| 1.690176847631321 | 0.504 | 0.947 | 0.533 |
| 1.693318440284911 | 0.504 | 0.944 | 0.535 |
| 1.6964600329385 | 0.504 | 0.942 | 0.536 |
| 1.69960162559209 | 0.504 | 0.939 | 0.538 |
| 1.70274321824568 | 0.504 | 0.936 | 0.54 |
| 1.70588481089927 | 0.505 | 0.934 | 0.542 |
| 1.70902640355286 | 0.505 | 0.931 | 0.544 |
| 1.712167996206449 | 0.505 | 0.928 | 0.546 |
| 1.715309588860039 | 0.505 | 0.925 | 0.548 |
| 1.71845118151363 | 0.505 | 0.922 | 0.551 |
| 1.721592774167219 | 0.506 | 0.919 | 0.553 |
| 1.724734366820809 | 0.506 | 0.916 | 0.555 |
| 1.727875959474399 | 0.506 | 0.913 | 0.557 |
| 1.731017552127988 | 0.506 | 0.91 | 0.56 |
| 1.734159144781578 | 0.507 | 0.907 | 0.562 |
| 1.737300737435168 | 0.507 | 0.903 | 0.565 |
| 1.740442330088758 | 0.507 | 0.9 | 0.567 |
| 1.743583922742348 | 0.508 | 0.897 | 0.57 |
| 1.746725515395937 | 0.508 | 0.894 | 0.573 |
| 1.749867108049527 | 0.508 | 0.891 | 0.575 |
| 1.753008700703117 | 0.508 | 0.887 | 0.578 |
| 1.756150293356707 | 0.509 | 0.884 | 0.581 |
| 1.759291886010297 | 0.509 | 0.881 | 0.584 |
| 1.762433478663887 | 0.509 | 0.877 | 0.587 |
| 1.765575071317476 | 0.51 | 0.874 | 0.59 |
| 1.768716663971066 | 0.51 | 0.871 | 0.593 |
| 1.771858256624656 | 0.51 | 0.867 | 0.596 |
| 1.774999849278246 | 0.51 | 0.864 | 0.599 |
| 1.778141441931836 | 0.511 | 0.86 | 0.602 |
| 1.781283034585426 | 0.511 | 0.857 | 0.606 |
| 1.784424627239015 | 0.511 | 0.853 | 0.609 |
| 1.787566219892605 | 0.512 | 0.85 | 0.612 |
| 1.790707812546195 | 0.512 | 0.847 | 0.616 |
| 1.793849405199785 | 0.513 | 0.843 | 0.619 |
| 1.796990997853375 | 0.513 | 0.84 | 0.623 |
| 1.800132590506964 | 0.513 | 0.836 | 0.626 |
| 1.803274183160554 | 0.514 | 0.833 | 0.63 |
| 1.806415775814144 | 0.514 | 0.829 | 0.634 |
| 1.809557368467734 | 0.514 | 0.826 | 0.637 |
| 1.812698961121324 | 0.515 | 0.822 | 0.641 |
| 1.815840553774914 | 0.515 | 0.819 | 0.645 |
| 1.818982146428503 | 0.516 | 0.815 | 0.649 |
| 1.822123739082093 | 0.516 | 0.812 | 0.653 |
| 1.825265331735683 | 0.516 | 0.808 | 0.657 |
| 1.828406924389273 | 0.517 | 0.805 | 0.661 |
| 1.831548517042863 | 0.517 | 0.801 | 0.665 |
| 1.834690109696452 | 0.518 | 0.798 | 0.669 |
| 1.837831702350042 | 0.518 | 0.794 | 0.674 |
| 1.840973295003632 | 0.518 | 0.791 | 0.678 |
| 1.844114887657222 | 0.519 | 0.787 | 0.682 |
| 1.847256480310812 | 0.519 | 0.784 | 0.687 |
| 1.850398072964402 | 0.52 | 0.78 | 0.691 |
| 1.853539665617991 | 0.52 | 0.777 | 0.696 |
| 1.856681258271581 | 0.521 | 0.774 | 0.7 |
| 1.859822850925171 | 0.521 | 0.77 | 0.705 |
| 1.862964443578761 | 0.522 | 0.767 | 0.71 |
| 1.866106036232351 | 0.522 | 0.763 | 0.714 |
| 1.86924762888594 | 0.523 | 0.76 | 0.719 |
| 1.87238922153953 | 0.523 | 0.757 | 0.724 |
| 1.87553081419312 | 0.524 | 0.753 | 0.729 |
| 1.87867240684671 | 0.524 | 0.75 | 0.733 |
| 1.8818139995003 | 0.525 | 0.747 | 0.738 |
| 1.88495559215389 | 0.525 | 0.743 | 0.743 |
| 1.888097184807479 | 0.526 | 0.74 | 0.748 |
| 1.891238777461069 | 0.526 | 0.737 | 0.753 |
| 1.89438037011466 | 0.527 | 0.733 | 0.758 |
| 1.897521962768249 | 0.527 | 0.73 | 0.763 |
| 1.900663555421839 | 0.528 | 0.727 | 0.768 |
| 1.903805148075429 | 0.528 | 0.724 | 0.774 |
| 1.906946740729018 | 0.529 | 0.721 | 0.779 |
| 1.910088333382608 | 0.529 | 0.717 | 0.784 |
| 1.913229926036198 | 0.53 | 0.714 | 0.789 |
| 1.916371518689788 | 0.53 | 0.711 | 0.794 |
| 1.919513111343378 | 0.531 | 0.708 | 0.799 |
| 1.922654703996967 | 0.532 | 0.705 | 0.805 |
| 1.925796296650557 | 0.532 | 0.702 | 0.81 |
| 1.928937889304147 | 0.533 | 0.699 | 0.815 |
| 1.932079481957737 | 0.533 | 0.696 | 0.82 |
| 1.935221074611327 | 0.534 | 0.693 | 0.826 |
| 1.938362667264917 | 0.535 | 0.69 | 0.831 |
| 1.941504259918506 | 0.535 | 0.687 | 0.836 |
| 1.944645852572096 | 0.536 | 0.684 | 0.841 |
| 1.947787445225686 | 0.536 | 0.681 | 0.847 |
| 1.950929037879276 | 0.537 | 0.678 | 0.852 |
| 1.954070630532866 | 0.538 | 0.675 | 0.857 |
| 1.957212223186455 | 0.538 | 0.672 | 0.862 |
| 1.960353815840045 | 0.539 | 0.669 | 0.867 |
| 1.963495408493635 | 0.54 | 0.667 | 0.872 |
| 1.966637001147225 | 0.54 | 0.664 | 0.877 |
| 1.969778593800815 | 0.541 | 0.661 | 0.882 |
| 1.972920186454405 | 0.541 | 0.658 | 0.887 |
| 1.976061779107994 | 0.542 | 0.656 | 0.892 |
| 1.979203371761584 | 0.543 | 0.653 | 0.897 |
| 1.982344964415174 | 0.543 | 0.65 | 0.902 |
| 1.985486557068764 | 0.544 | 0.648 | 0.907 |
| 1.988628149722354 | 0.545 | 0.645 | 0.911 |
| 1.991769742375943 | 0.546 | 0.642 | 0.916 |
| 1.994911335029533 | 0.546 | 0.64 | 0.92 |
| 1.998052927683123 | 0.547 | 0.637 | 0.925 |
| 2.001194520336712 | 0.548 | 0.635 | 0.929 |
| 2.004336112990302 | 0.548 | 0.632 | 0.934 |
| 2.007477705643892 | 0.549 | 0.63 | 0.938 |
| 2.010619298297482 | 0.55 | 0.627 | 0.942 |
| 2.013760890951071 | 0.551 | 0.625 | 0.946 |
| 2.016902483604661 | 0.551 | 0.623 | 0.95 |
| 2.02004407625825 | 0.552 | 0.62 | 0.953 |
| 2.02318566891184 | 0.553 | 0.618 | 0.957 |
| 2.02632726156543 | 0.554 | 0.616 | 0.961 |
| 2.029468854219019 | 0.554 | 0.613 | 0.964 |
| 2.032610446872609 | 0.555 | 0.611 | 0.967 |
| 2.035752039526198 | 0.556 | 0.609 | 0.97 |
| 2.038893632179788 | 0.557 | 0.607 | 0.973 |
| 2.042035224833378 | 0.557 | 0.604 | 0.976 |
| 2.045176817486967 | 0.558 | 0.602 | 0.979 |
| 2.048318410140557 | 0.559 | 0.6 | 0.981 |
| 2.051460002794146 | 0.56 | 0.598 | 0.984 |
| 2.054601595447736 | 0.561 | 0.596 | 0.986 |
| 2.057743188101325 | 0.561 | 0.594 | 0.988 |
| 2.060884780754915 | 0.562 | 0.592 | 0.99 |
| 2.064026373408505 | 0.563 | 0.59 | 0.992 |
| 2.067167966062094 | 0.564 | 0.588 | 0.993 |
| 2.070309558715684 | 0.565 | 0.586 | 0.995 |
| 2.073451151369273 | 0.566 | 0.584 | 0.996 |
| 2.076592744022863 | 0.566 | 0.582 | 0.997 |
| 2.079734336676452 | 0.567 | 0.58 | 0.998 |
| 2.082875929330042 | 0.568 | 0.578 | 0.999 |
| 2.086017521983632 | 0.569 | 0.576 | 0.999 |
| 2.089159114637221 | 0.57 | 0.574 | 1 |
| 2.092300707290811 | 0.571 | 0.573 | 1 |
| 2.095442299944401 | 0.572 | 0.571 | 1 |
| 2.09858389259799 | 0.573 | 0.569 | 1 |
| 2.10172548525158 | 0.574 | 0.567 | 1 |
| 2.104867077905169 | 0.574 | 0.566 | 0.999 |
| 2.108008670558759 | 0.575 | 0.564 | 0.998 |
| 2.111150263212349 | 0.576 | 0.562 | 0.997 |
| 2.114291855865938 | 0.577 | 0.561 | 0.996 |
| 2.117433448519528 | 0.578 | 0.559 | 0.995 |
| 2.120575041173117 | 0.579 | 0.557 | 0.994 |
| 2.123716633826707 | 0.58 | 0.556 | 0.992 |
| 2.126858226480297 | 0.581 | 0.554 | 0.991 |
| 2.129999819133886 | 0.582 | 0.553 | 0.989 |
| 2.133141411787476 | 0.583 | 0.551 | 0.987 |
| 2.136283004441065 | 0.584 | 0.55 | 0.985 |
| 2.139424597094655 | 0.585 | 0.548 | 0.982 |
| 2.142566189748245 | 0.586 | 0.547 | 0.98 |
| 2.145707782401834 | 0.587 | 0.546 | 0.977 |
| 2.148849375055424 | 0.588 | 0.544 | 0.974 |
| 2.151990967709013 | 0.589 | 0.543 | 0.971 |
| 2.155132560362603 | 0.59 | 0.541 | 0.968 |
| 2.158274153016193 | 0.591 | 0.54 | 0.965 |
| 2.161415745669782 | 0.592 | 0.539 | 0.962 |
| 2.164557338323372 | 0.593 | 0.538 | 0.958 |
| 2.167698930976961 | 0.594 | 0.536 | 0.955 |
| 2.170840523630551 | 0.595 | 0.535 | 0.951 |
| 2.173982116284141 | 0.596 | 0.534 | 0.947 |
| 2.17712370893773 | 0.597 | 0.533 | 0.943 |
| 2.18026530159132 | 0.598 | 0.532 | 0.939 |
| 2.183406894244909 | 0.599 | 0.53 | 0.935 |
| 2.186548486898499 | 0.6 | 0.529 | 0.931 |
| 2.189690079552089 | 0.601 | 0.528 | 0.926 |
| 2.192831672205678 | 0.602 | 0.527 | 0.922 |
| 2.195973264859268 | 0.603 | 0.526 | 0.917 |
| 2.199114857512857 | 0.604 | 0.525 | 0.913 |
| 2.202256450166447 | 0.606 | 0.524 | 0.908 |
| 2.205398042820036 | 0.607 | 0.523 | 0.903 |
| 2.208539635473626 | 0.608 | 0.522 | 0.899 |
| 2.211681228127216 | 0.609 | 0.521 | 0.894 |
| 2.214822820780805 | 0.61 | 0.52 | 0.889 |
| 2.217964413434395 | 0.611 | 0.519 | 0.884 |
| 2.221106006087984 | 0.612 | 0.518 | 0.879 |
| 2.224247598741574 | 0.613 | 0.518 | 0.874 |
| 2.227389191395164 | 0.614 | 0.517 | 0.869 |
| 2.230530784048753 | 0.616 | 0.516 | 0.864 |
| 2.233672376702343 | 0.617 | 0.515 | 0.859 |
| 2.236813969355933 | 0.618 | 0.514 | 0.853 |
| 2.239955562009522 | 0.619 | 0.514 | 0.848 |
| 2.243097154663112 | 0.62 | 0.513 | 0.843 |
| 2.246238747316701 | 0.621 | 0.512 | 0.838 |
| 2.249380339970291 | 0.623 | 0.511 | 0.833 |
| 2.252521932623881 | 0.624 | 0.511 | 0.827 |
| 2.25566352527747 | 0.625 | 0.51 | 0.822 |
| 2.25880511793106 | 0.626 | 0.51 | 0.817 |
| 2.261946710584649 | 0.627 | 0.509 | 0.812 |
| 2.265088303238239 | 0.629 | 0.508 | 0.806 |
| 2.268229895891829 | 0.63 | 0.508 | 0.801 |
| 2.271371488545418 | 0.631 | 0.507 | 0.796 |
| 2.274513081199008 | 0.632 | 0.507 | 0.791 |
| 2.277654673852597 | 0.634 | 0.506 | 0.786 |
| 2.280796266506186 | 0.635 | 0.506 | 0.78 |
| 2.283937859159776 | 0.636 | 0.505 | 0.775 |
| 2.287079451813366 | 0.637 | 0.505 | 0.77 |
| 2.290221044466955 | 0.639 | 0.504 | 0.765 |
| 2.293362637120545 | 0.64 | 0.504 | 0.76 |
| 2.296504229774135 | 0.641 | 0.504 | 0.755 |
| 2.299645822427724 | 0.642 | 0.503 | 0.75 |
| 2.302787415081314 | 0.644 | 0.503 | 0.745 |
| 2.305929007734904 | 0.645 | 0.503 | 0.74 |
| 2.309070600388493 | 0.646 | 0.502 | 0.735 |
| 2.312212193042083 | 0.648 | 0.502 | 0.73 |
| 2.315353785695672 | 0.649 | 0.502 | 0.725 |
| 2.318495378349262 | 0.65 | 0.501 | 0.721 |
| 2.321636971002852 | 0.652 | 0.501 | 0.716 |
| 2.324778563656441 | 0.653 | 0.501 | 0.711 |
| 2.327920156310031 | 0.654 | 0.501 | 0.706 |
| 2.33106174896362 | 0.656 | 0.501 | 0.702 |
| 2.33420334161721 | 0.657 | 0.5 | 0.697 |
| 2.3373449342708 | 0.658 | 0.5 | 0.693 |
| 2.340486526924389 | 0.66 | 0.5 | 0.688 |
| 2.343628119577979 | 0.661 | 0.5 | 0.684 |
| 2.346769712231568 | 0.663 | 0.5 | 0.679 |
| 2.349911304885158 | 0.664 | 0.5 | 0.675 |
| 2.353052897538748 | 0.665 | 0.5 | 0.671 |
| 2.356194490192337 | 0.667 | 0.5 | 0.667 |
| 2.359336082845927 | 0.668 | 0.5 | 0.663 |
| 2.362477675499516 | 0.669 | 0.5 | 0.658 |
| 2.365619268153106 | 0.671 | 0.5 | 0.654 |
| 2.368760860806696 | 0.672 | 0.5 | 0.65 |
| 2.371902453460285 | 0.674 | 0.5 | 0.646 |
| 2.375044046113875 | 0.675 | 0.5 | 0.642 |
| 2.378185638767464 | 0.677 | 0.5 | 0.639 |
| 2.381327231421054 | 0.678 | 0.501 | 0.635 |
| 2.384468824074644 | 0.679 | 0.501 | 0.631 |
| 2.387610416728233 | 0.681 | 0.501 | 0.627 |
| 2.390752009381823 | 0.682 | 0.501 | 0.624 |
| 2.393893602035412 | 0.684 | 0.501 | 0.62 |
| 2.397035194689002 | 0.685 | 0.502 | 0.617 |
| 2.400176787342591 | 0.687 | 0.502 | 0.613 |
| 2.403318379996181 | 0.688 | 0.502 | 0.61 |
| 2.406459972649771 | 0.69 | 0.503 | 0.607 |
| 2.40960156530336 | 0.691 | 0.503 | 0.603 |
| 2.41274315795695 | 0.693 | 0.503 | 0.6 |
| 2.41588475061054 | 0.694 | 0.504 | 0.597 |
| 2.419026343264129 | 0.696 | 0.504 | 0.594 |
| 2.422167935917719 | 0.697 | 0.504 | 0.591 |
| 2.425309528571308 | 0.699 | 0.505 | 0.588 |
| 2.428451121224898 | 0.7 | 0.505 | 0.585 |
| 2.431592713878488 | 0.702 | 0.506 | 0.582 |
| 2.434734306532077 | 0.703 | 0.506 | 0.579 |
| 2.437875899185667 | 0.705 | 0.507 | 0.576 |
| 2.441017491839256 | 0.706 | 0.507 | 0.574 |
| 2.444159084492846 | 0.708 | 0.508 | 0.571 |
| 2.447300677146435 | 0.71 | 0.508 | 0.568 |
| 2.450442269800025 | 0.711 | 0.509 | 0.566 |
| 2.453583862453615 | 0.713 | 0.51 | 0.563 |
| 2.456725455107204 | 0.714 | 0.51 | 0.561 |
| 2.459867047760794 | 0.716 | 0.511 | 0.558 |
| 2.463008640414384 | 0.717 | 0.511 | 0.556 |
| 2.466150233067973 | 0.719 | 0.512 | 0.554 |
| 2.469291825721563 | 0.721 | 0.513 | 0.551 |
| 2.472433418375152 | 0.722 | 0.514 | 0.549 |
| 2.475575011028742 | 0.724 | 0.514 | 0.547 |
| 2.478716603682332 | 0.725 | 0.515 | 0.545 |
| 2.481858196335921 | 0.727 | 0.516 | 0.543 |
| 2.48499978898951 | 0.729 | 0.517 | 0.541 |
| 2.4881413816431 | 0.73 | 0.518 | 0.539 |
| 2.49128297429669 | 0.732 | 0.518 | 0.537 |
| 2.49442456695028 | 0.733 | 0.519 | 0.535 |
| 2.497566159603869 | 0.735 | 0.52 | 0.533 |
| 2.500707752257458 | 0.737 | 0.521 | 0.532 |
| 2.503849344911048 | 0.738 | 0.522 | 0.53 |
| 2.506990937564638 | 0.74 | 0.523 | 0.528 |
| 2.510132530218228 | 0.742 | 0.524 | 0.527 |
| 2.513274122871817 | 0.743 | 0.525 | 0.525 |
| 2.516415715525407 | 0.745 | 0.526 | 0.524 |
| 2.519557308178996 | 0.747 | 0.527 | 0.522 |
| 2.522698900832586 | 0.748 | 0.528 | 0.521 |
| 2.525840493486176 | 0.75 | 0.529 | 0.519 |
| 2.528982086139765 | 0.752 | 0.53 | 0.518 |
| 2.532123678793355 | 0.753 | 0.532 | 0.517 |
| 2.535265271446944 | 0.755 | 0.533 | 0.516 |
| 2.538406864100534 | 0.757 | 0.534 | 0.514 |
| 2.541548456754124 | 0.758 | 0.535 | 0.513 |
| 2.544690049407713 | 0.76 | 0.536 | 0.512 |
| 2.547831642061302 | 0.762 | 0.538 | 0.511 |
| 2.550973234714892 | 0.763 | 0.539 | 0.51 |
| 2.554114827368482 | 0.765 | 0.54 | 0.509 |
| 2.557256420022072 | 0.767 | 0.541 | 0.508 |
| 2.560398012675661 | 0.768 | 0.543 | 0.508 |
| 2.563539605329251 | 0.77 | 0.544 | 0.507 |
| 2.56668119798284 | 0.772 | 0.546 | 0.506 |
| 2.56982279063643 | 0.774 | 0.547 | 0.505 |
| 2.57296438329002 | 0.775 | 0.548 | 0.505 |
| 2.576105975943609 | 0.777 | 0.55 | 0.504 |
| 2.579247568597199 | 0.779 | 0.551 | 0.503 |
| 2.582389161250788 | 0.78 | 0.553 | 0.503 |
| 2.585530753904377 | 0.782 | 0.554 | 0.502 |
| 2.588672346557967 | 0.784 | 0.556 | 0.502 |
| 2.591813939211557 | 0.786 | 0.557 | 0.502 |
| 2.594955531865147 | 0.787 | 0.559 | 0.501 |
| 2.598097124518736 | 0.789 | 0.561 | 0.501 |
| 2.601238717172326 | 0.791 | 0.562 | 0.501 |
| 2.604380309825915 | 0.792 | 0.564 | 0.5 |
| 2.607521902479505 | 0.794 | 0.566 | 0.5 |
| 2.610663495133095 | 0.796 | 0.567 | 0.5 |
| 2.613805087786684 | 0.798 | 0.569 | 0.5 |
| 2.616946680440274 | 0.799 | 0.571 | 0.5 |
| 2.620088273093863 | 0.801 | 0.573 | 0.5 |
| 2.623229865747452 | 0.803 | 0.574 | 0.5 |
| 2.626371458401042 | 0.805 | 0.576 | 0.5 |
| 2.629513051054632 | 0.806 | 0.578 | 0.5 |
| 2.632654643708222 | 0.808 | 0.58 | 0.5 |
| 2.635796236361811 | 0.81 | 0.582 | 0.501 |
| 2.638937829015401 | 0.812 | 0.584 | 0.501 |
| 2.642079421668991 | 0.813 | 0.586 | 0.501 |
| 2.64522101432258 | 0.815 | 0.588 | 0.502 |
| 2.64836260697617 | 0.817 | 0.59 | 0.502 |
| 2.651504199629759 | 0.819 | 0.592 | 0.503 |
| 2.654645792283349 | 0.82 | 0.594 | 0.503 |
| 2.657787384936938 | 0.822 | 0.596 | 0.504 |
| 2.660928977590528 | 0.824 | 0.598 | 0.504 |
| 2.664070570244118 | 0.826 | 0.6 | 0.505 |
| 2.667212162897707 | 0.827 | 0.602 | 0.505 |
| 2.670353755551297 | 0.829 | 0.604 | 0.506 |
| 2.673495348204887 | 0.831 | 0.607 | 0.507 |
| 2.676636940858476 | 0.833 | 0.609 | 0.508 |
| 2.679778533512066 | 0.834 | 0.611 | 0.509 |
| 2.682920126165655 | 0.836 | 0.613 | 0.51 |
| 2.686061718819245 | 0.838 | 0.616 | 0.51 |
| 2.689203311472835 | 0.84 | 0.618 | 0.511 |
| 2.692344904126424 | 0.841 | 0.62 | 0.513 |
| 2.695486496780014 | 0.843 | 0.623 | 0.514 |
| 2.698628089433603 | 0.845 | 0.625 | 0.515 |
| 2.701769682087193 | 0.847 | 0.627 | 0.516 |
| 2.704911274740782 | 0.848 | 0.63 | 0.517 |
| 2.708052867394372 | 0.85 | 0.632 | 0.518 |
| 2.711194460047962 | 0.852 | 0.635 | 0.52 |
| 2.714336052701551 | 0.853 | 0.637 | 0.521 |
| 2.717477645355141 | 0.855 | 0.64 | 0.523 |
| 2.720619238008731 | 0.857 | 0.642 | 0.524 |
| 2.72376083066232 | 0.859 | 0.645 | 0.526 |
| 2.72690242331591 | 0.86 | 0.648 | 0.527 |
| 2.730044015969499 | 0.862 | 0.65 | 0.529 |
| 2.733185608623089 | 0.864 | 0.653 | 0.53 |
| 2.736327201276678 | 0.865 | 0.656 | 0.532 |
| 2.739468793930268 | 0.867 | 0.658 | 0.534 |
| 2.742610386583858 | 0.869 | 0.661 | 0.536 |
| 2.745751979237447 | 0.871 | 0.664 | 0.538 |
| 2.748893571891036 | 0.872 | 0.667 | 0.54 |
| 2.752035164544627 | 0.874 | 0.669 | 0.541 |
| 2.755176757198216 | 0.876 | 0.672 | 0.543 |
| 2.758318349851806 | 0.877 | 0.675 | 0.546 |
| 2.761459942505395 | 0.879 | 0.678 | 0.548 |
| 2.764601535158985 | 0.881 | 0.681 | 0.55 |
| 2.767743127812574 | 0.882 | 0.684 | 0.552 |
| 2.770884720466164 | 0.884 | 0.687 | 0.554 |
| 2.774026313119754 | 0.886 | 0.69 | 0.557 |
| 2.777167905773343 | 0.887 | 0.693 | 0.559 |
| 2.780309498426932 | 0.889 | 0.696 | 0.561 |
| 2.783451091080522 | 0.891 | 0.699 | 0.564 |
| 2.786592683734112 | 0.892 | 0.702 | 0.566 |
| 2.789734276387701 | 0.894 | 0.705 | 0.569 |
| 2.792875869041291 | 0.895 | 0.708 | 0.572 |
| 2.796017461694881 | 0.897 | 0.711 | 0.574 |
| 2.79915905434847 | 0.899 | 0.714 | 0.577 |
| 2.80230064700206 | 0.9 | 0.717 | 0.58 |
| 2.80544223965565 | 0.902 | 0.721 | 0.583 |
| 2.808583832309239 | 0.903 | 0.724 | 0.586 |
| 2.811725424962829 | 0.905 | 0.727 | 0.589 |
| 2.814867017616419 | 0.907 | 0.73 | 0.592 |
| 2.818008610270008 | 0.908 | 0.733 | 0.595 |
| 2.821150202923598 | 0.91 | 0.737 | 0.598 |
| 2.824291795577187 | 0.911 | 0.74 | 0.601 |
| 2.827433388230777 | 0.913 | 0.743 | 0.604 |
| 2.830574980884366 | 0.914 | 0.747 | 0.608 |
| 2.833716573537956 | 0.916 | 0.75 | 0.611 |
| 2.836858166191546 | 0.917 | 0.753 | 0.614 |
| 2.839999758845135 | 0.919 | 0.757 | 0.618 |
| 2.843141351498725 | 0.92 | 0.76 | 0.621 |
| 2.846282944152314 | 0.922 | 0.763 | 0.625 |
| 2.849424536805904 | 0.923 | 0.767 | 0.629 |
| 2.852566129459494 | 0.925 | 0.77 | 0.632 |
| 2.855707722113083 | 0.926 | 0.774 | 0.636 |
| 2.858849314766673 | 0.928 | 0.777 | 0.64 |
| 2.861990907420262 | 0.929 | 0.78 | 0.644 |
| 2.865132500073852 | 0.931 | 0.784 | 0.648 |
| 2.868274092727442 | 0.932 | 0.787 | 0.652 |
| 2.871415685381031 | 0.934 | 0.791 | 0.656 |
| 2.874557278034621 | 0.935 | 0.794 | 0.66 |
| 2.87769887068821 | 0.936 | 0.798 | 0.664 |
| 2.8808404633418 | 0.938 | 0.801 | 0.668 |
| 2.88398205599539 | 0.939 | 0.805 | 0.672 |
| 2.88712364864898 | 0.94 | 0.808 | 0.677 |
| 2.890265241302569 | 0.942 | 0.812 | 0.681 |
| 2.893406833956158 | 0.943 | 0.815 | 0.685 |
| 2.896548426609748 | 0.944 | 0.819 | 0.69 |
| 2.899690019263338 | 0.946 | 0.822 | 0.694 |
| 2.902831611916927 | 0.947 | 0.826 | 0.699 |
| 2.905973204570517 | 0.948 | 0.829 | 0.703 |
| 2.909114797224106 | 0.95 | 0.833 | 0.708 |
| 2.912256389877696 | 0.951 | 0.836 | 0.713 |
| 2.915397982531286 | 0.952 | 0.84 | 0.717 |
| 2.918539575184875 | 0.953 | 0.843 | 0.722 |
| 2.921681167838465 | 0.955 | 0.847 | 0.727 |
| 2.924822760492054 | 0.956 | 0.85 | 0.732 |
| 2.927964353145644 | 0.957 | 0.853 | 0.737 |
| 2.931105945799234 | 0.958 | 0.857 | 0.742 |
| 2.934247538452823 | 0.959 | 0.86 | 0.747 |
| 2.937389131106413 | 0.961 | 0.864 | 0.752 |
| 2.940530723760002 | 0.962 | 0.867 | 0.757 |
| 2.943672316413592 | 0.963 | 0.871 | 0.762 |
| 2.946813909067182 | 0.964 | 0.874 | 0.767 |
| 2.949955501720771 | 0.965 | 0.877 | 0.772 |
| 2.953097094374361 | 0.966 | 0.881 | 0.777 |
| 2.95623868702795 | 0.967 | 0.884 | 0.782 |
| 2.95938027968154 | 0.968 | 0.887 | 0.787 |
| 2.96252187233513 | 0.969 | 0.891 | 0.792 |
| 2.965663464988719 | 0.97 | 0.894 | 0.798 |
| 2.968805057642309 | 0.971 | 0.897 | 0.803 |
| 2.971946650295898 | 0.972 | 0.9 | 0.808 |
| 2.975088242949488 | 0.973 | 0.903 | 0.813 |
| 2.978229835603078 | 0.974 | 0.907 | 0.819 |
| 2.981371428256667 | 0.975 | 0.91 | 0.824 |
| 2.984513020910257 | 0.976 | 0.913 | 0.829 |
| 2.987654613563846 | 0.977 | 0.916 | 0.834 |
| 2.990796206217436 | 0.978 | 0.919 | 0.84 |
| 2.993937798871025 | 0.979 | 0.922 | 0.845 |
| 2.997079391524615 | 0.98 | 0.925 | 0.85 |
| 3.000220984178205 | 0.981 | 0.928 | 0.855 |
| 3.003362576831794 | 0.981 | 0.931 | 0.86 |
| 3.006504169485384 | 0.982 | 0.934 | 0.865 |
| 3.009645762138974 | 0.983 | 0.936 | 0.871 |
| 3.012787354792563 | 0.984 | 0.939 | 0.876 |
| 3.015928947446153 | 0.985 | 0.942 | 0.881 |
| 3.019070540099742 | 0.985 | 0.944 | 0.886 |
| 3.022212132753332 | 0.986 | 0.947 | 0.891 |
| 3.025353725406922 | 0.987 | 0.95 | 0.895 |
| 3.028495318060511 | 0.987 | 0.952 | 0.9 |
| 3.031636910714101 | 0.988 | 0.955 | 0.905 |
| 3.03477850336769 | 0.989 | 0.957 | 0.91 |
| 3.03792009602128 | 0.989 | 0.959 | 0.914 |
| 3.04106168867487 | 0.99 | 0.962 | 0.919 |
| 3.04420328132846 | 0.991 | 0.964 | 0.923 |
| 3.047344873982049 | 0.991 | 0.966 | 0.928 |
| 3.050486466635638 | 0.992 | 0.968 | 0.932 |
| 3.053628059289228 | 0.992 | 0.97 | 0.936 |
| 3.056769651942818 | 0.993 | 0.972 | 0.94 |
| 3.059911244596407 | 0.993 | 0.974 | 0.944 |
| 3.063052837249997 | 0.994 | 0.976 | 0.948 |
| 3.066194429903586 | 0.994 | 0.978 | 0.952 |
| 3.069336022557176 | 0.995 | 0.98 | 0.956 |
| 3.072477615210766 | 0.995 | 0.981 | 0.959 |
| 3.075619207864355 | 0.996 | 0.983 | 0.963 |
| 3.078760800517945 | 0.996 | 0.985 | 0.966 |
| 3.081902393171534 | 0.996 | 0.986 | 0.969 |
| 3.085043985825124 | 0.997 | 0.987 | 0.972 |
| 3.088185578478713 | 0.997 | 0.989 | 0.975 |
| 3.091327171132303 | 0.997 | 0.99 | 0.978 |
| 3.094468763785893 | 0.998 | 0.991 | 0.981 |
| 3.097610356439482 | 0.998 | 0.992 | 0.983 |
| 3.100751949093072 | 0.998 | 0.993 | 0.985 |
| 3.103893541746661 | 0.999 | 0.994 | 0.987 |
| 3.107035134400251 | 0.999 | 0.995 | 0.989 |
| 3.110176727053841 | 0.999 | 0.996 | 0.991 |
| 3.11331831970743 | 0.999 | 0.997 | 0.993 |
| 3.11645991236102 | 0.999 | 0.997 | 0.994 |
| 3.11960150501461 | 1 | 0.998 | 0.996 |
| 3.122743097668199 | 1 | 0.999 | 0.997 |
| 3.125884690321789 | 1 | 0.999 | 0.998 |
| 3.129026282975378 | 1 | 0.999 | 0.999 |
| 3.132167875628968 | 1 | 1 | 0.999 |
| 3.135309468282557 | 1 | 1 | 1 |
| 3.138451060936147 | 1 | 1 | 1 |
| 3.141592653589737 | 1 | 1 | 1 |
| 3.144734246243326 | 1 | 1 | 1 |
| 3.147875838896916 | 1 | 1 | 1 |
| 3.151017431550505 | 1 | 1 | 0.999 |
| 3.154159024204095 | 1 | 0.999 | 0.999 |
| 3.157300616857685 | 1 | 0.999 | 0.998 |
| 3.160442209511274 | 1 | 0.999 | 0.997 |
| 3.163583802164864 | 1 | 0.998 | 0.996 |
| 3.166725394818453 | 0.999 | 0.997 | 0.994 |
| 3.169866987472043 | 0.999 | 0.997 | 0.993 |
| 3.173008580125633 | 0.999 | 0.996 | 0.991 |
| 3.176150172779222 | 0.999 | 0.995 | 0.989 |
| 3.179291765432812 | 0.999 | 0.994 | 0.987 |
| 3.182433358086401 | 0.998 | 0.993 | 0.985 |
| 3.185574950739991 | 0.998 | 0.992 | 0.983 |
| 3.188716543393581 | 0.998 | 0.991 | 0.981 |
| 3.19185813604717 | 0.997 | 0.99 | 0.978 |
| 3.19499972870076 | 0.997 | 0.989 | 0.975 |
| 3.198141321354349 | 0.997 | 0.987 | 0.972 |
| 3.20128291400794 | 0.996 | 0.986 | 0.969 |
| 3.204424506661528 | 0.996 | 0.985 | 0.966 |
| 3.207566099315118 | 0.996 | 0.983 | 0.963 |
| 3.210707691968708 | 0.995 | 0.981 | 0.959 |
| 3.213849284622297 | 0.995 | 0.98 | 0.956 |
| 3.216990877275887 | 0.994 | 0.978 | 0.952 |
| 3.220132469929476 | 0.994 | 0.976 | 0.948 |
| 3.223274062583066 | 0.993 | 0.974 | 0.944 |
| 3.226415655236656 | 0.993 | 0.972 | 0.94 |
| 3.229557247890245 | 0.992 | 0.97 | 0.936 |
| 3.232698840543835 | 0.992 | 0.968 | 0.932 |
| 3.235840433197425 | 0.991 | 0.966 | 0.928 |
| 3.238982025851014 | 0.991 | 0.964 | 0.923 |
| 3.242123618504604 | 0.99 | 0.962 | 0.919 |
| 3.245265211158193 | 0.989 | 0.959 | 0.914 |
| 3.248406803811783 | 0.989 | 0.957 | 0.91 |
| 3.251548396465373 | 0.988 | 0.955 | 0.905 |
| 3.254689989118962 | 0.987 | 0.952 | 0.9 |
| 3.257831581772551 | 0.987 | 0.95 | 0.895 |
| 3.260973174426141 | 0.986 | 0.947 | 0.891 |
| 3.26411476707973 | 0.985 | 0.944 | 0.886 |
| 3.267256359733321 | 0.985 | 0.942 | 0.881 |
| 3.27039795238691 | 0.984 | 0.939 | 0.876 |
| 3.2735395450405 | 0.983 | 0.936 | 0.871 |
| 3.276681137694089 | 0.982 | 0.934 | 0.865 |
| 3.279822730347679 | 0.981 | 0.931 | 0.86 |
| 3.282964323001269 | 0.981 | 0.928 | 0.855 |
| 3.286105915654858 | 0.98 | 0.925 | 0.85 |
| 3.289247508308448 | 0.979 | 0.922 | 0.845 |
| 3.292389100962037 | 0.978 | 0.919 | 0.84 |
| 3.295530693615627 | 0.977 | 0.916 | 0.834 |
| 3.298672286269217 | 0.976 | 0.913 | 0.829 |
| 3.301813878922806 | 0.975 | 0.91 | 0.824 |
| 3.304955471576396 | 0.974 | 0.907 | 0.819 |
| 3.308097064229985 | 0.973 | 0.903 | 0.813 |
| 3.311238656883575 | 0.972 | 0.9 | 0.808 |
| 3.314380249537165 | 0.971 | 0.897 | 0.803 |
| 3.317521842190754 | 0.97 | 0.894 | 0.798 |
| 3.320663434844344 | 0.969 | 0.891 | 0.792 |
| 3.323805027497933 | 0.968 | 0.887 | 0.787 |
| 3.326946620151523 | 0.967 | 0.884 | 0.782 |
| 3.330088212805113 | 0.966 | 0.881 | 0.777 |
| 3.333229805458702 | 0.965 | 0.877 | 0.772 |
| 3.336371398112292 | 0.964 | 0.874 | 0.767 |
| 3.339512990765881 | 0.963 | 0.871 | 0.762 |
| 3.342654583419471 | 0.962 | 0.867 | 0.757 |
| 3.345796176073061 | 0.961 | 0.864 | 0.752 |
| 3.34893776872665 | 0.959 | 0.86 | 0.747 |
| 3.35207936138024 | 0.958 | 0.857 | 0.742 |
| 3.355220954033829 | 0.957 | 0.853 | 0.737 |
| 3.358362546687419 | 0.956 | 0.85 | 0.732 |
| 3.361504139341009 | 0.955 | 0.847 | 0.727 |
| 3.364645731994598 | 0.953 | 0.843 | 0.722 |
| 3.367787324648188 | 0.952 | 0.84 | 0.717 |
| 3.370928917301777 | 0.951 | 0.836 | 0.713 |
| 3.374070509955367 | 0.95 | 0.833 | 0.708 |
| 3.377212102608956 | 0.948 | 0.829 | 0.703 |
| 3.380353695262546 | 0.947 | 0.826 | 0.699 |
| 3.383495287916136 | 0.946 | 0.822 | 0.694 |
| 3.386636880569725 | 0.944 | 0.819 | 0.69 |
| 3.389778473223315 | 0.943 | 0.815 | 0.685 |
| 3.392920065876904 | 0.942 | 0.812 | 0.681 |
| 3.396061658530494 | 0.94 | 0.808 | 0.677 |
| 3.399203251184084 | 0.939 | 0.805 | 0.672 |
| 3.402344843837673 | 0.938 | 0.801 | 0.668 |
| 3.405486436491263 | 0.936 | 0.798 | 0.664 |
| 3.408628029144852 | 0.935 | 0.794 | 0.66 |
| 3.411769621798442 | 0.934 | 0.791 | 0.656 |
| 3.414911214452032 | 0.932 | 0.787 | 0.652 |
| 3.418052807105621 | 0.931 | 0.784 | 0.648 |
| 3.421194399759211 | 0.929 | 0.78 | 0.644 |
| 3.4243359924128 | 0.928 | 0.777 | 0.64 |
| 3.42747758506639 | 0.926 | 0.774 | 0.636 |
| 3.43061917771998 | 0.925 | 0.77 | 0.632 |
| 3.433760770373569 | 0.923 | 0.767 | 0.629 |
| 3.436902363027159 | 0.922 | 0.763 | 0.625 |
| 3.440043955680748 | 0.92 | 0.76 | 0.621 |
| 3.443185548334338 | 0.919 | 0.757 | 0.618 |
| 3.446327140987927 | 0.917 | 0.753 | 0.614 |
| 3.449468733641517 | 0.916 | 0.75 | 0.611 |
| 3.452610326295107 | 0.914 | 0.747 | 0.608 |
| 3.455751918948696 | 0.913 | 0.743 | 0.604 |
| 3.458893511602286 | 0.911 | 0.74 | 0.601 |
| 3.462035104255876 | 0.91 | 0.737 | 0.598 |
| 3.465176696909465 | 0.908 | 0.733 | 0.595 |
| 3.468318289563055 | 0.907 | 0.73 | 0.592 |
| 3.471459882216644 | 0.905 | 0.727 | 0.589 |
| 3.474601474870234 | 0.903 | 0.724 | 0.586 |
| 3.477743067523824 | 0.902 | 0.721 | 0.583 |
| 3.480884660177413 | 0.9 | 0.717 | 0.58 |
| 3.484026252831002 | 0.899 | 0.714 | 0.577 |
| 3.487167845484592 | 0.897 | 0.711 | 0.574 |
| 3.490309438138182 | 0.895 | 0.708 | 0.572 |
| 3.493451030791772 | 0.894 | 0.705 | 0.569 |
| 3.496592623445361 | 0.892 | 0.702 | 0.566 |
| 3.499734216098951 | 0.891 | 0.699 | 0.564 |
| 3.50287580875254 | 0.889 | 0.696 | 0.561 |
| 3.50601740140613 | 0.887 | 0.693 | 0.559 |
| 3.50915899405972 | 0.886 | 0.69 | 0.557 |
| 3.512300586713309 | 0.884 | 0.687 | 0.554 |
| 3.515442179366899 | 0.882 | 0.684 | 0.552 |
| 3.518583772020488 | 0.881 | 0.681 | 0.55 |
| 3.521725364674078 | 0.879 | 0.678 | 0.548 |
| 3.524866957327668 | 0.877 | 0.675 | 0.546 |
| 3.528008549981257 | 0.876 | 0.672 | 0.543 |
| 3.531150142634847 | 0.874 | 0.669 | 0.541 |
| 3.534291735288436 | 0.872 | 0.667 | 0.54 |
| 3.537433327942026 | 0.871 | 0.664 | 0.538 |
| 3.540574920595616 | 0.869 | 0.661 | 0.536 |
| 3.543716513249205 | 0.867 | 0.658 | 0.534 |
| 3.546858105902795 | 0.865 | 0.656 | 0.532 |
| 3.549999698556384 | 0.864 | 0.653 | 0.53 |
| 3.553141291209974 | 0.862 | 0.65 | 0.529 |
| 3.556282883863564 | 0.86 | 0.648 | 0.527 |
| 3.559424476517153 | 0.859 | 0.645 | 0.526 |
| 3.562566069170743 | 0.857 | 0.642 | 0.524 |
| 3.565707661824332 | 0.855 | 0.64 | 0.523 |
| 3.568849254477922 | 0.853 | 0.637 | 0.521 |
| 3.571990847131511 | 0.852 | 0.635 | 0.52 |
| 3.575132439785101 | 0.85 | 0.632 | 0.518 |
| 3.578274032438691 | 0.848 | 0.63 | 0.517 |
| 3.58141562509228 | 0.847 | 0.627 | 0.516 |
| 3.58455721774587 | 0.845 | 0.625 | 0.515 |
| 3.58769881039946 | 0.843 | 0.623 | 0.514 |
| 3.590840403053049 | 0.841 | 0.62 | 0.513 |
| 3.593981995706639 | 0.84 | 0.618 | 0.511 |
| 3.597123588360228 | 0.838 | 0.616 | 0.51 |
| 3.600265181013818 | 0.836 | 0.613 | 0.51 |
| 3.603406773667407 | 0.834 | 0.611 | 0.509 |
| 3.606548366320997 | 0.833 | 0.609 | 0.508 |
| 3.609689958974587 | 0.831 | 0.607 | 0.507 |
| 3.612831551628176 | 0.829 | 0.604 | 0.506 |
| 3.615973144281766 | 0.827 | 0.602 | 0.505 |
| 3.619114736935355 | 0.826 | 0.6 | 0.505 |
| 3.622256329588945 | 0.824 | 0.598 | 0.504 |
| 3.625397922242534 | 0.822 | 0.596 | 0.504 |
| 3.628539514896124 | 0.82 | 0.594 | 0.503 |
| 3.631681107549714 | 0.819 | 0.592 | 0.503 |
| 3.634822700203303 | 0.817 | 0.59 | 0.502 |
| 3.637964292856893 | 0.815 | 0.588 | 0.502 |
| 3.641105885510483 | 0.813 | 0.586 | 0.501 |
| 3.644247478164072 | 0.812 | 0.584 | 0.501 |
| 3.647389070817662 | 0.81 | 0.582 | 0.501 |
| 3.650530663471251 | 0.808 | 0.58 | 0.5 |
| 3.653672256124841 | 0.806 | 0.578 | 0.5 |
| 3.656813848778431 | 0.805 | 0.576 | 0.5 |
| 3.65995544143202 | 0.803 | 0.574 | 0.5 |
| 3.66309703408561 | 0.801 | 0.573 | 0.5 |
| 3.666238626739199 | 0.799 | 0.571 | 0.5 |
| 3.66938021939279 | 0.798 | 0.569 | 0.5 |
| 3.672521812046378 | 0.796 | 0.567 | 0.5 |
| 3.675663404699968 | 0.794 | 0.566 | 0.5 |
| 3.678804997353558 | 0.792 | 0.564 | 0.5 |
| 3.681946590007147 | 0.791 | 0.562 | 0.501 |
| 3.685088182660737 | 0.789 | 0.561 | 0.501 |
| 3.688229775314326 | 0.787 | 0.559 | 0.501 |
| 3.691371367967916 | 0.786 | 0.557 | 0.502 |
| 3.694512960621506 | 0.784 | 0.556 | 0.502 |
| 3.697654553275095 | 0.782 | 0.554 | 0.502 |
| 3.700796145928685 | 0.78 | 0.553 | 0.503 |
| 3.703937738582274 | 0.779 | 0.551 | 0.503 |
| 3.707079331235864 | 0.777 | 0.55 | 0.504 |
| 3.710220923889454 | 0.775 | 0.548 | 0.505 |
| 3.713362516543043 | 0.774 | 0.547 | 0.505 |
| 3.716504109196633 | 0.772 | 0.546 | 0.506 |
| 3.719645701850223 | 0.77 | 0.544 | 0.507 |
| 3.722787294503812 | 0.768 | 0.543 | 0.508 |
| 3.725928887157402 | 0.767 | 0.541 | 0.508 |
| 3.729070479810991 | 0.765 | 0.54 | 0.509 |
| 3.732212072464581 | 0.763 | 0.539 | 0.51 |
| 3.735353665118171 | 0.762 | 0.538 | 0.511 |
| 3.73849525777176 | 0.76 | 0.536 | 0.512 |
| 3.74163685042535 | 0.758 | 0.535 | 0.513 |
| 3.744778443078939 | 0.757 | 0.534 | 0.514 |
| 3.747920035732529 | 0.755 | 0.533 | 0.516 |
| 3.751061628386119 | 0.753 | 0.532 | 0.517 |
| 3.754203221039708 | 0.752 | 0.53 | 0.518 |
| 3.757344813693298 | 0.75 | 0.529 | 0.519 |
| 3.760486406346887 | 0.748 | 0.528 | 0.521 |
| 3.763627999000477 | 0.747 | 0.527 | 0.522 |
| 3.766769591654067 | 0.745 | 0.526 | 0.524 |
| 3.769911184307656 | 0.743 | 0.525 | 0.525 |
| 3.773052776961246 | 0.742 | 0.524 | 0.527 |
| 3.776194369614835 | 0.74 | 0.523 | 0.528 |
| 3.779335962268425 | 0.738 | 0.522 | 0.53 |
| 3.782477554922014 | 0.737 | 0.521 | 0.532 |
| 3.785619147575604 | 0.735 | 0.52 | 0.533 |
| 3.788760740229193 | 0.733 | 0.519 | 0.535 |
| 3.791902332882783 | 0.732 | 0.518 | 0.537 |
| 3.795043925536373 | 0.73 | 0.518 | 0.539 |
| 3.798185518189962 | 0.729 | 0.517 | 0.541 |
| 3.801327110843552 | 0.727 | 0.516 | 0.543 |
| 3.804468703497142 | 0.725 | 0.515 | 0.545 |
| 3.807610296150731 | 0.724 | 0.514 | 0.547 |
| 3.810751888804321 | 0.722 | 0.514 | 0.549 |
| 3.813893481457911 | 0.721 | 0.513 | 0.551 |
| 3.8170350741115 | 0.719 | 0.512 | 0.554 |
| 3.82017666676509 | 0.717 | 0.511 | 0.556 |
| 3.823318259418679 | 0.716 | 0.511 | 0.558 |
| 3.826459852072269 | 0.714 | 0.51 | 0.561 |
| 3.829601444725859 | 0.713 | 0.51 | 0.563 |
| 3.832743037379448 | 0.711 | 0.509 | 0.566 |
| 3.835884630033038 | 0.71 | 0.508 | 0.568 |
| 3.839026222686627 | 0.708 | 0.508 | 0.571 |
| 3.842167815340217 | 0.706 | 0.507 | 0.574 |
| 3.845309407993807 | 0.705 | 0.507 | 0.576 |
| 3.848451000647396 | 0.703 | 0.506 | 0.579 |
| 3.851592593300986 | 0.702 | 0.506 | 0.582 |
| 3.854734185954575 | 0.7 | 0.505 | 0.585 |
| 3.857875778608165 | 0.699 | 0.505 | 0.588 |
| 3.861017371261755 | 0.697 | 0.504 | 0.591 |
| 3.864158963915344 | 0.696 | 0.504 | 0.594 |
| 3.867300556568933 | 0.694 | 0.504 | 0.597 |
| 3.870442149222523 | 0.693 | 0.503 | 0.6 |
| 3.873583741876112 | 0.691 | 0.503 | 0.603 |
| 3.876725334529703 | 0.69 | 0.503 | 0.607 |
| 3.879866927183292 | 0.688 | 0.502 | 0.61 |
| 3.883008519836882 | 0.687 | 0.502 | 0.613 |
| 3.886150112490471 | 0.685 | 0.502 | 0.617 |
| 3.889291705144061 | 0.684 | 0.501 | 0.62 |
| 3.892433297797651 | 0.682 | 0.501 | 0.624 |
| 3.89557489045124 | 0.681 | 0.501 | 0.627 |
| 3.89871648310483 | 0.679 | 0.501 | 0.631 |
| 3.901858075758419 | 0.678 | 0.501 | 0.635 |
| 3.904999668412009 | 0.677 | 0.5 | 0.639 |
| 3.908141261065598 | 0.675 | 0.5 | 0.642 |
| 3.911282853719188 | 0.674 | 0.5 | 0.646 |
| 3.914424446372778 | 0.672 | 0.5 | 0.65 |
| 3.917566039026367 | 0.671 | 0.5 | 0.654 |
| 3.920707631679957 | 0.669 | 0.5 | 0.658 |
| 3.923849224333547 | 0.668 | 0.5 | 0.663 |
| 3.926990816987136 | 0.667 | 0.5 | 0.667 |
| 3.930132409640726 | 0.665 | 0.5 | 0.671 |
| 3.933274002294315 | 0.664 | 0.5 | 0.675 |
| 3.936415594947905 | 0.663 | 0.5 | 0.679 |
| 3.939557187601495 | 0.661 | 0.5 | 0.684 |
| 3.942698780255084 | 0.66 | 0.5 | 0.688 |
| 3.945840372908674 | 0.658 | 0.5 | 0.693 |
| 3.948981965562263 | 0.657 | 0.5 | 0.697 |
| 3.952123558215853 | 0.656 | 0.501 | 0.702 |
| 3.955265150869442 | 0.654 | 0.501 | 0.706 |
| 3.958406743523032 | 0.653 | 0.501 | 0.711 |
| 3.961548336176622 | 0.652 | 0.501 | 0.716 |
| 3.964689928830211 | 0.65 | 0.501 | 0.721 |
| 3.967831521483801 | 0.649 | 0.502 | 0.725 |
| 3.97097311413739 | 0.648 | 0.502 | 0.73 |
| 3.97411470679098 | 0.646 | 0.502 | 0.735 |
| 3.97725629944457 | 0.645 | 0.503 | 0.74 |
| 3.98039789209816 | 0.644 | 0.503 | 0.745 |
| 3.983539484751749 | 0.642 | 0.503 | 0.75 |
| 3.986681077405338 | 0.641 | 0.504 | 0.755 |
| 3.989822670058928 | 0.64 | 0.504 | 0.76 |
| 3.992964262712517 | 0.639 | 0.504 | 0.765 |
| 3.996105855366107 | 0.637 | 0.505 | 0.77 |
| 3.999247448019697 | 0.636 | 0.505 | 0.775 |
| 4.002389040673287 | 0.635 | 0.506 | 0.78 |
| 4.005530633326877 | 0.634 | 0.506 | 0.786 |
| 4.008672225980466 | 0.632 | 0.507 | 0.791 |
| 4.011813818634056 | 0.631 | 0.507 | 0.796 |
| 4.014955411287645 | 0.63 | 0.508 | 0.801 |
| 4.018097003941234 | 0.629 | 0.508 | 0.806 |
| 4.021238596594824 | 0.627 | 0.509 | 0.812 |
| 4.024380189248414 | 0.626 | 0.51 | 0.817 |
| 4.027521781902004 | 0.625 | 0.51 | 0.822 |
| 4.030663374555593 | 0.624 | 0.511 | 0.827 |
| 4.033804967209183 | 0.623 | 0.511 | 0.833 |
| 4.036946559862773 | 0.621 | 0.512 | 0.838 |
| 4.040088152516362 | 0.62 | 0.513 | 0.843 |
| 4.043229745169951 | 0.619 | 0.514 | 0.848 |
| 4.046371337823541 | 0.618 | 0.514 | 0.853 |
| 4.049512930477131 | 0.617 | 0.515 | 0.859 |
| 4.05265452313072 | 0.616 | 0.516 | 0.864 |
| 4.05579611578431 | 0.614 | 0.517 | 0.869 |
| 4.0589377084379 | 0.613 | 0.518 | 0.874 |
| 4.062079301091489 | 0.612 | 0.518 | 0.879 |
| 4.065220893745079 | 0.611 | 0.519 | 0.884 |
| 4.068362486398668 | 0.61 | 0.52 | 0.889 |
| 4.071504079052258 | 0.609 | 0.521 | 0.894 |
| 4.074645671705848 | 0.608 | 0.522 | 0.899 |
| 4.077787264359437 | 0.607 | 0.523 | 0.903 |
| 4.080928857013027 | 0.606 | 0.524 | 0.908 |
| 4.084070449666616 | 0.604 | 0.525 | 0.913 |
| 4.087212042320206 | 0.603 | 0.526 | 0.917 |
| 4.090353634973795 | 0.602 | 0.527 | 0.922 |
| 4.093495227627385 | 0.601 | 0.528 | 0.926 |
| 4.096636820280975 | 0.6 | 0.529 | 0.931 |
| 4.099778412934564 | 0.599 | 0.53 | 0.935 |
| 4.102920005588154 | 0.598 | 0.532 | 0.939 |
| 4.106061598241744 | 0.597 | 0.533 | 0.943 |
| 4.109203190895333 | 0.596 | 0.534 | 0.947 |
| 4.112344783548923 | 0.595 | 0.535 | 0.951 |
| 4.115486376202512 | 0.594 | 0.536 | 0.955 |
| 4.118627968856102 | 0.593 | 0.538 | 0.958 |
| 4.121769561509692 | 0.592 | 0.539 | 0.962 |
| 4.124911154163281 | 0.591 | 0.54 | 0.965 |
| 4.128052746816871 | 0.59 | 0.541 | 0.968 |
| 4.13119433947046 | 0.589 | 0.543 | 0.971 |
| 4.13433593212405 | 0.588 | 0.544 | 0.974 |
| 4.13747752477764 | 0.587 | 0.546 | 0.977 |
| 4.14061911743123 | 0.586 | 0.547 | 0.98 |
| 4.143760710084818 | 0.585 | 0.548 | 0.982 |
| 4.146902302738408 | 0.584 | 0.55 | 0.985 |
| 4.150043895391998 | 0.583 | 0.551 | 0.987 |
| 4.153185488045588 | 0.582 | 0.553 | 0.989 |
| 4.156327080699177 | 0.581 | 0.554 | 0.991 |
| 4.159468673352766 | 0.58 | 0.556 | 0.992 |
| 4.162610266006356 | 0.579 | 0.557 | 0.994 |
| 4.165751858659946 | 0.578 | 0.559 | 0.995 |
| 4.168893451313535 | 0.577 | 0.561 | 0.996 |
| 4.172035043967125 | 0.576 | 0.562 | 0.997 |
| 4.175176636620715 | 0.575 | 0.564 | 0.998 |
| 4.178318229274304 | 0.574 | 0.566 | 0.999 |
| 4.181459821927894 | 0.574 | 0.567 | 1 |
| 4.184601414581484 | 0.573 | 0.569 | 1 |
| 4.187743007235073 | 0.572 | 0.571 | 1 |
| 4.190884599888663 | 0.571 | 0.573 | 1 |
| 4.194026192542252 | 0.57 | 0.574 | 1 |
| 4.197167785195842 | 0.569 | 0.576 | 0.999 |
| 4.200309377849432 | 0.568 | 0.578 | 0.999 |
| 4.203450970503021 | 0.567 | 0.58 | 0.998 |
| 4.206592563156611 | 0.566 | 0.582 | 0.997 |
| 4.2097341558102 | 0.566 | 0.584 | 0.996 |
| 4.21287574846379 | 0.565 | 0.586 | 0.995 |
| 4.21601734111738 | 0.564 | 0.588 | 0.993 |
| 4.21915893377097 | 0.563 | 0.59 | 0.992 |
| 4.222300526424559 | 0.562 | 0.592 | 0.99 |
| 4.225442119078148 | 0.561 | 0.594 | 0.988 |
| 4.228583711731738 | 0.561 | 0.596 | 0.986 |
| 4.231725304385327 | 0.56 | 0.598 | 0.984 |
| 4.234866897038917 | 0.559 | 0.6 | 0.981 |
| 4.238008489692506 | 0.558 | 0.602 | 0.979 |
| 4.241150082346096 | 0.557 | 0.604 | 0.976 |
| 4.244291674999685 | 0.557 | 0.607 | 0.973 |
| 4.247433267653276 | 0.556 | 0.609 | 0.97 |
| 4.250574860306865 | 0.555 | 0.611 | 0.967 |
| 4.253716452960455 | 0.554 | 0.613 | 0.964 |
| 4.256858045614044 | 0.554 | 0.616 | 0.961 |
| 4.259999638267634 | 0.553 | 0.618 | 0.957 |
| 4.263141230921224 | 0.552 | 0.62 | 0.953 |
| 4.266282823574813 | 0.551 | 0.623 | 0.95 |
| 4.269424416228403 | 0.551 | 0.625 | 0.946 |
| 4.272566008881992 | 0.55 | 0.627 | 0.942 |
| 4.275707601535582 | 0.549 | 0.63 | 0.938 |
| 4.27884919418917 | 0.548 | 0.632 | 0.934 |
| 4.28199078684276 | 0.548 | 0.635 | 0.929 |
| 4.285132379496351 | 0.547 | 0.637 | 0.925 |
| 4.28827397214994 | 0.546 | 0.64 | 0.92 |
| 4.29141556480353 | 0.546 | 0.642 | 0.916 |
| 4.294557157457119 | 0.545 | 0.645 | 0.911 |
| 4.29769875011071 | 0.544 | 0.648 | 0.907 |
| 4.300840342764299 | 0.543 | 0.65 | 0.902 |
| 4.303981935417888 | 0.543 | 0.653 | 0.897 |
| 4.307123528071478 | 0.542 | 0.656 | 0.892 |
| 4.310265120725067 | 0.541 | 0.658 | 0.887 |
| 4.313406713378657 | 0.541 | 0.661 | 0.882 |
| 4.316548306032247 | 0.54 | 0.664 | 0.877 |
| 4.319689898685836 | 0.54 | 0.667 | 0.872 |
| 4.322831491339426 | 0.539 | 0.669 | 0.867 |
| 4.325973083993015 | 0.538 | 0.672 | 0.862 |
| 4.329114676646605 | 0.538 | 0.675 | 0.857 |
| 4.332256269300195 | 0.537 | 0.678 | 0.852 |
| 4.335397861953784 | 0.536 | 0.681 | 0.847 |
| 4.338539454607374 | 0.536 | 0.684 | 0.841 |
| 4.341681047260963 | 0.535 | 0.687 | 0.836 |
| 4.344822639914553 | 0.535 | 0.69 | 0.831 |
| 4.347964232568143 | 0.534 | 0.693 | 0.826 |
| 4.351105825221732 | 0.533 | 0.696 | 0.82 |
| 4.354247417875322 | 0.533 | 0.699 | 0.815 |
| 4.357389010528911 | 0.532 | 0.702 | 0.81 |
| 4.360530603182501 | 0.532 | 0.705 | 0.805 |
| 4.36367219583609 | 0.531 | 0.708 | 0.799 |
| 4.36681378848968 | 0.53 | 0.711 | 0.794 |
| 4.36995538114327 | 0.53 | 0.714 | 0.789 |
| 4.373096973796859 | 0.529 | 0.717 | 0.784 |
| 4.376238566450449 | 0.529 | 0.721 | 0.779 |
| 4.379380159104038 | 0.528 | 0.724 | 0.774 |
| 4.382521751757628 | 0.528 | 0.727 | 0.768 |
| 4.385663344411217 | 0.527 | 0.73 | 0.763 |
| 4.388804937064807 | 0.527 | 0.733 | 0.758 |
| 4.391946529718397 | 0.526 | 0.737 | 0.753 |
| 4.395088122371987 | 0.526 | 0.74 | 0.748 |
| 4.398229715025576 | 0.525 | 0.743 | 0.743 |
| 4.401371307679165 | 0.525 | 0.747 | 0.738 |
| 4.404512900332755 | 0.524 | 0.75 | 0.733 |
| 4.407654492986345 | 0.524 | 0.753 | 0.729 |
| 4.410796085639934 | 0.523 | 0.757 | 0.724 |
| 4.413937678293524 | 0.523 | 0.76 | 0.719 |
| 4.417079270947114 | 0.522 | 0.763 | 0.714 |
| 4.420220863600703 | 0.522 | 0.767 | 0.71 |
| 4.423362456254293 | 0.521 | 0.77 | 0.705 |
| 4.426504048907883 | 0.521 | 0.774 | 0.7 |
| 4.429645641561472 | 0.52 | 0.777 | 0.696 |
| 4.432787234215062 | 0.52 | 0.78 | 0.691 |
| 4.435928826868651 | 0.519 | 0.784 | 0.687 |
| 4.43907041952224 | 0.519 | 0.787 | 0.682 |
| 4.44221201217583 | 0.518 | 0.791 | 0.678 |
| 4.44535360482942 | 0.518 | 0.794 | 0.674 |
| 4.44849519748301 | 0.518 | 0.798 | 0.669 |
| 4.4516367901366 | 0.517 | 0.801 | 0.665 |
| 4.454778382790188 | 0.517 | 0.805 | 0.661 |
| 4.457919975443779 | 0.516 | 0.808 | 0.657 |
| 4.461061568097368 | 0.516 | 0.812 | 0.653 |
| 4.464203160750958 | 0.516 | 0.815 | 0.649 |
| 4.467344753404547 | 0.515 | 0.819 | 0.645 |
| 4.470486346058137 | 0.515 | 0.822 | 0.641 |
| 4.473627938711726 | 0.514 | 0.826 | 0.637 |
| 4.476769531365316 | 0.514 | 0.829 | 0.634 |
| 4.479911124018905 | 0.514 | 0.833 | 0.63 |
| 4.483052716672495 | 0.513 | 0.836 | 0.626 |
| 4.486194309326085 | 0.513 | 0.84 | 0.623 |
| 4.489335901979674 | 0.513 | 0.843 | 0.619 |
| 4.492477494633264 | 0.512 | 0.847 | 0.616 |
| 4.495619087286854 | 0.512 | 0.85 | 0.612 |
| 4.498760679940443 | 0.511 | 0.853 | 0.609 |
| 4.501902272594033 | 0.511 | 0.857 | 0.606 |
| 4.505043865247622 | 0.511 | 0.86 | 0.602 |
| 4.508185457901212 | 0.51 | 0.864 | 0.599 |
| 4.511327050554801 | 0.51 | 0.867 | 0.596 |
| 4.514468643208391 | 0.51 | 0.871 | 0.593 |
| 4.517610235861981 | 0.51 | 0.874 | 0.59 |
| 4.520751828515571 | 0.509 | 0.877 | 0.587 |
| 4.52389342116916 | 0.509 | 0.881 | 0.584 |
| 4.52703501382275 | 0.509 | 0.884 | 0.581 |
| 4.530176606476339 | 0.508 | 0.887 | 0.578 |
| 4.533318199129928 | 0.508 | 0.891 | 0.575 |
| 4.536459791783518 | 0.508 | 0.894 | 0.573 |
| 4.539601384437108 | 0.508 | 0.897 | 0.57 |
| 4.542742977090698 | 0.507 | 0.9 | 0.567 |
| 4.545884569744287 | 0.507 | 0.903 | 0.565 |
| 4.549026162397876 | 0.507 | 0.907 | 0.562 |
| 4.552167755051466 | 0.506 | 0.91 | 0.56 |
| 4.555309347705056 | 0.506 | 0.913 | 0.557 |
| 4.558450940358646 | 0.506 | 0.916 | 0.555 |
| 4.561592533012235 | 0.506 | 0.919 | 0.553 |
| 4.564734125665825 | 0.505 | 0.922 | 0.551 |
| 4.567875718319415 | 0.505 | 0.925 | 0.548 |
| 4.571017310973004 | 0.505 | 0.928 | 0.546 |
| 4.574158903626594 | 0.505 | 0.931 | 0.544 |
| 4.577300496280183 | 0.505 | 0.934 | 0.542 |
| 4.580442088933772 | 0.504 | 0.936 | 0.54 |
| 4.583583681587362 | 0.504 | 0.939 | 0.538 |
| 4.586725274240952 | 0.504 | 0.942 | 0.536 |
| 4.589866866894542 | 0.504 | 0.944 | 0.535 |
| 4.593008459548131 | 0.504 | 0.947 | 0.533 |
| 4.596150052201721 | 0.503 | 0.95 | 0.531 |
| 4.59929164485531 | 0.503 | 0.952 | 0.529 |
| 4.6024332375089 | 0.503 | 0.955 | 0.528 |
| 4.60557483016249 | 0.503 | 0.957 | 0.526 |
| 4.608716422816079 | 0.503 | 0.959 | 0.525 |
| 4.611858015469668 | 0.503 | 0.962 | 0.523 |
| 4.614999608123258 | 0.502 | 0.964 | 0.522 |
| 4.618141200776848 | 0.502 | 0.966 | 0.52 |
| 4.621282793430437 | 0.502 | 0.968 | 0.519 |
| 4.624424386084027 | 0.502 | 0.97 | 0.518 |
| 4.627565978737617 | 0.502 | 0.972 | 0.516 |
| 4.630707571391206 | 0.502 | 0.974 | 0.515 |
| 4.633849164044795 | 0.502 | 0.976 | 0.514 |
| 4.636990756698386 | 0.501 | 0.978 | 0.513 |
| 4.640132349351975 | 0.501 | 0.98 | 0.512 |
| 4.643273942005564 | 0.501 | 0.981 | 0.511 |
| 4.646415534659154 | 0.501 | 0.983 | 0.51 |
| 4.649557127312744 | 0.501 | 0.985 | 0.509 |
| 4.652698719966334 | 0.501 | 0.986 | 0.508 |
| 4.655840312619923 | 0.501 | 0.987 | 0.507 |
| 4.658981905273513 | 0.501 | 0.989 | 0.506 |
| 4.662123497927102 | 0.501 | 0.99 | 0.506 |
| 4.665265090580692 | 0.501 | 0.991 | 0.505 |
| 4.668406683234282 | 0.5 | 0.992 | 0.504 |
| 4.671548275887871 | 0.5 | 0.993 | 0.504 |
| 4.674689868541461 | 0.5 | 0.994 | 0.503 |
| 4.67783146119505 | 0.5 | 0.995 | 0.503 |
| 4.68097305384864 | 0.5 | 0.996 | 0.502 |
| 4.68411464650223 | 0.5 | 0.997 | 0.502 |
| 4.687256239155819 | 0.5 | 0.997 | 0.501 |
| 4.690397831809409 | 0.5 | 0.998 | 0.501 |
| 4.693539424462998 | 0.5 | 0.999 | 0.501 |
| 4.696681017116588 | 0.5 | 0.999 | 0.501 |
| 4.699822609770177 | 0.5 | 0.999 | 0.5 |
| 4.702964202423767 | 0.5 | 1 | 0.5 |
| 4.706105795077356 | 0.5 | 1 | 0.5 |
| 4.709247387730946 | 0.5 | 1 | 0.5 |
| 4.712388980384535 | 0.5 | 1 | 0.5 |
| 4.715530573038126 | 0.5 | 1 | 0.5 |
| 4.718672165691715 | 0.5 | 1 | 0.5 |
| 4.721813758345305 | 0.5 | 1 | 0.5 |
| 4.724955350998894 | 0.5 | 0.999 | 0.5 |
| 4.728096943652484 | 0.5 | 0.999 | 0.501 |
| 4.731238536306074 | 0.5 | 0.999 | 0.501 |
| 4.734380128959663 | 0.5 | 0.998 | 0.501 |
| 4.737521721613253 | 0.5 | 0.997 | 0.501 |
| 4.740663314266842 | 0.5 | 0.997 | 0.502 |
| 4.743804906920432 | 0.5 | 0.996 | 0.502 |
| 4.74694649957402 | 0.5 | 0.995 | 0.503 |
| 4.750088092227611 | 0.5 | 0.994 | 0.503 |
| 4.7532296848812 | 0.5 | 0.993 | 0.504 |
| 4.75637127753479 | 0.5 | 0.992 | 0.504 |
| 4.75951287018838 | 0.501 | 0.991 | 0.505 |
| 4.76265446284197 | 0.501 | 0.99 | 0.506 |
| 4.765796055495559 | 0.501 | 0.989 | 0.506 |
| 4.768937648149149 | 0.501 | 0.987 | 0.507 |
| 4.772079240802738 | 0.501 | 0.986 | 0.508 |
| 4.775220833456327 | 0.501 | 0.985 | 0.509 |
| 4.778362426109917 | 0.501 | 0.983 | 0.51 |
| 4.781504018763507 | 0.501 | 0.981 | 0.511 |
| 4.784645611417097 | 0.501 | 0.98 | 0.512 |
| 4.787787204070686 | 0.501 | 0.978 | 0.513 |
| 4.790928796724275 | 0.502 | 0.976 | 0.514 |
| 4.794070389377865 | 0.502 | 0.974 | 0.515 |
| 4.797211982031455 | 0.502 | 0.972 | 0.516 |
| 4.800353574685045 | 0.502 | 0.97 | 0.518 |
| 4.803495167338634 | 0.502 | 0.968 | 0.519 |
| 4.806636759992224 | 0.502 | 0.966 | 0.52 |
| 4.809778352645814 | 0.502 | 0.964 | 0.522 |
| 4.812919945299403 | 0.503 | 0.962 | 0.523 |
| 4.816061537952993 | 0.503 | 0.959 | 0.525 |
| 4.819203130606582 | 0.503 | 0.957 | 0.526 |
| 4.822344723260172 | 0.503 | 0.955 | 0.528 |
| 4.825486315913761 | 0.503 | 0.952 | 0.529 |
| 4.828627908567351 | 0.503 | 0.95 | 0.531 |
| 4.83176950122094 | 0.504 | 0.947 | 0.533 |
| 4.83491109387453 | 0.504 | 0.944 | 0.535 |
| 4.83805268652812 | 0.504 | 0.942 | 0.536 |
| 4.841194279181709 | 0.504 | 0.939 | 0.538 |
| 4.844335871835299 | 0.504 | 0.936 | 0.54 |
| 4.847477464488889 | 0.505 | 0.934 | 0.542 |
| 4.850619057142478 | 0.505 | 0.931 | 0.544 |
| 4.853760649796068 | 0.505 | 0.928 | 0.546 |
| 4.856902242449657 | 0.505 | 0.925 | 0.548 |
| 4.860043835103247 | 0.505 | 0.922 | 0.551 |
| 4.863185427756837 | 0.506 | 0.919 | 0.553 |
| 4.866327020410426 | 0.506 | 0.916 | 0.555 |
| 4.869468613064015 | 0.506 | 0.913 | 0.557 |
| 4.872610205717605 | 0.506 | 0.91 | 0.56 |
| 4.875751798371195 | 0.507 | 0.907 | 0.562 |
| 4.878893391024784 | 0.507 | 0.903 | 0.565 |
| 4.882034983678374 | 0.507 | 0.9 | 0.567 |
| 4.885176576331964 | 0.508 | 0.897 | 0.57 |
| 4.888318168985553 | 0.508 | 0.894 | 0.573 |
| 4.891459761639143 | 0.508 | 0.891 | 0.575 |
| 4.894601354292733 | 0.508 | 0.887 | 0.578 |
| 4.897742946946322 | 0.509 | 0.884 | 0.581 |
| 4.900884539599912 | 0.509 | 0.881 | 0.584 |
| 4.904026132253501 | 0.509 | 0.877 | 0.587 |
| 4.907167724907091 | 0.51 | 0.874 | 0.59 |
| 4.91030931756068 | 0.51 | 0.871 | 0.593 |
| 4.91345091021427 | 0.51 | 0.867 | 0.596 |
| 4.91659250286786 | 0.51 | 0.864 | 0.599 |
| 4.91973409552145 | 0.511 | 0.86 | 0.602 |
| 4.922875688175039 | 0.511 | 0.857 | 0.606 |
| 4.926017280828628 | 0.511 | 0.853 | 0.609 |
| 4.929158873482218 | 0.512 | 0.85 | 0.612 |
| 4.932300466135808 | 0.512 | 0.847 | 0.616 |
| 4.935442058789397 | 0.513 | 0.843 | 0.619 |
| 4.938583651442987 | 0.513 | 0.84 | 0.623 |
| 4.941725244096576 | 0.513 | 0.836 | 0.626 |
| 4.944866836750166 | 0.514 | 0.833 | 0.63 |
| 4.948008429403755 | 0.514 | 0.829 | 0.634 |
| 4.951150022057345 | 0.514 | 0.826 | 0.637 |
| 4.954291614710935 | 0.515 | 0.822 | 0.641 |
| 4.957433207364524 | 0.515 | 0.819 | 0.645 |
| 4.960574800018114 | 0.516 | 0.815 | 0.649 |
| 4.963716392671704 | 0.516 | 0.812 | 0.653 |
| 4.966857985325293 | 0.516 | 0.808 | 0.657 |
| 4.969999577978883 | 0.517 | 0.805 | 0.661 |
| 4.973141170632472 | 0.517 | 0.801 | 0.665 |
| 4.976282763286062 | 0.518 | 0.798 | 0.669 |
| 4.979424355939651 | 0.518 | 0.794 | 0.674 |
| 4.982565948593241 | 0.518 | 0.791 | 0.678 |
| 4.985707541246831 | 0.519 | 0.787 | 0.682 |
| 4.98884913390042 | 0.519 | 0.784 | 0.687 |
| 4.99199072655401 | 0.52 | 0.78 | 0.691 |
| 4.9951323192076 | 0.52 | 0.777 | 0.696 |
| 4.99827391186119 | 0.521 | 0.774 | 0.7 |
| 5.00141550451478 | 0.521 | 0.77 | 0.705 |
| 5.004557097168369 | 0.522 | 0.767 | 0.71 |
| 5.007698689821958 | 0.522 | 0.763 | 0.714 |
| 5.010840282475548 | 0.523 | 0.76 | 0.719 |
| 5.013981875129137 | 0.523 | 0.757 | 0.724 |
| 5.017123467782727 | 0.524 | 0.753 | 0.729 |
| 5.020265060436317 | 0.524 | 0.75 | 0.733 |
| 5.023406653089906 | 0.525 | 0.747 | 0.738 |
| 5.026548245743496 | 0.525 | 0.743 | 0.743 |
| 5.029689838397085 | 0.526 | 0.74 | 0.748 |
| 5.032831431050674 | 0.526 | 0.737 | 0.753 |
| 5.035973023704264 | 0.527 | 0.733 | 0.758 |
| 5.039114616357854 | 0.527 | 0.73 | 0.763 |
| 5.042256209011444 | 0.528 | 0.727 | 0.768 |
| 5.045397801665033 | 0.528 | 0.724 | 0.774 |
| 5.048539394318622 | 0.529 | 0.721 | 0.779 |
| 5.051680986972213 | 0.529 | 0.717 | 0.784 |
| 5.054822579625802 | 0.53 | 0.714 | 0.789 |
| 5.057964172279392 | 0.53 | 0.711 | 0.794 |
| 5.061105764932981 | 0.531 | 0.708 | 0.799 |
| 5.064247357586571 | 0.532 | 0.705 | 0.805 |
| 5.067388950240161 | 0.532 | 0.702 | 0.81 |
| 5.07053054289375 | 0.533 | 0.699 | 0.815 |
| 5.07367213554734 | 0.533 | 0.696 | 0.82 |
| 5.07681372820093 | 0.534 | 0.693 | 0.826 |
| 5.079955320854519 | 0.535 | 0.69 | 0.831 |
| 5.083096913508108 | 0.535 | 0.687 | 0.836 |
| 5.086238506161698 | 0.536 | 0.684 | 0.841 |
| 5.089380098815288 | 0.536 | 0.681 | 0.847 |
| 5.092521691468877 | 0.537 | 0.678 | 0.852 |
| 5.095663284122466 | 0.538 | 0.675 | 0.857 |
| 5.098804876776057 | 0.538 | 0.672 | 0.862 |
| 5.101946469429646 | 0.539 | 0.669 | 0.867 |
| 5.105088062083236 | 0.54 | 0.667 | 0.872 |
| 5.108229654736825 | 0.54 | 0.664 | 0.877 |
| 5.111371247390415 | 0.541 | 0.661 | 0.882 |
| 5.114512840044005 | 0.541 | 0.658 | 0.887 |
| 5.117654432697594 | 0.542 | 0.656 | 0.892 |
| 5.120796025351184 | 0.543 | 0.653 | 0.897 |
| 5.123937618004773 | 0.543 | 0.65 | 0.902 |
| 5.127079210658363 | 0.544 | 0.648 | 0.907 |
| 5.130220803311953 | 0.545 | 0.645 | 0.911 |
| 5.133362395965542 | 0.546 | 0.642 | 0.916 |
| 5.136503988619131 | 0.546 | 0.64 | 0.92 |
| 5.13964558127272 | 0.547 | 0.637 | 0.925 |
| 5.142787173926311 | 0.548 | 0.635 | 0.929 |
| 5.1459287665799 | 0.548 | 0.632 | 0.934 |
| 5.14907035923349 | 0.549 | 0.63 | 0.938 |
| 5.15221195188708 | 0.55 | 0.627 | 0.942 |
| 5.15535354454067 | 0.551 | 0.625 | 0.946 |
| 5.158495137194259 | 0.551 | 0.623 | 0.95 |
| 5.161636729847848 | 0.552 | 0.62 | 0.953 |
| 5.164778322501438 | 0.553 | 0.618 | 0.957 |
| 5.167919915155028 | 0.554 | 0.616 | 0.961 |
| 5.171061507808617 | 0.554 | 0.613 | 0.964 |
| 5.174203100462206 | 0.555 | 0.611 | 0.967 |
| 5.177344693115796 | 0.556 | 0.609 | 0.97 |
| 5.180486285769386 | 0.557 | 0.607 | 0.973 |
| 5.183627878422976 | 0.557 | 0.604 | 0.976 |
| 5.186769471076565 | 0.558 | 0.602 | 0.979 |
| 5.189911063730155 | 0.559 | 0.6 | 0.981 |
| 5.193052656383744 | 0.56 | 0.598 | 0.984 |
| 5.196194249037334 | 0.561 | 0.596 | 0.986 |
| 5.199335841690924 | 0.561 | 0.594 | 0.988 |
| 5.202477434344513 | 0.562 | 0.592 | 0.99 |
| 5.205619026998103 | 0.563 | 0.59 | 0.992 |
| 5.208760619651692 | 0.564 | 0.588 | 0.993 |
| 5.211902212305282 | 0.565 | 0.586 | 0.995 |
| 5.215043804958871 | 0.566 | 0.584 | 0.996 |
| 5.218185397612461 | 0.566 | 0.582 | 0.997 |
| 5.221326990266051 | 0.567 | 0.58 | 0.998 |
| 5.22446858291964 | 0.568 | 0.578 | 0.999 |
| 5.22761017557323 | 0.569 | 0.576 | 0.999 |
| 5.23075176822682 | 0.57 | 0.574 | 1 |
| 5.23389336088041 | 0.571 | 0.573 | 1 |
| 5.237034953533999 | 0.572 | 0.571 | 1 |
| 5.240176546187588 | 0.573 | 0.569 | 1 |
| 5.243318138841178 | 0.574 | 0.567 | 1 |
| 5.246459731494767 | 0.574 | 0.566 | 0.999 |
| 5.249601324148357 | 0.575 | 0.564 | 0.998 |
| 5.252742916801947 | 0.576 | 0.562 | 0.997 |
| 5.255884509455536 | 0.577 | 0.561 | 0.996 |
| 5.259026102109125 | 0.578 | 0.559 | 0.995 |
| 5.262167694762715 | 0.579 | 0.557 | 0.994 |
| 5.265309287416305 | 0.58 | 0.556 | 0.992 |
| 5.268450880069895 | 0.581 | 0.554 | 0.991 |
| 5.271592472723484 | 0.582 | 0.553 | 0.989 |
| 5.274734065377074 | 0.583 | 0.551 | 0.987 |
| 5.277875658030664 | 0.584 | 0.55 | 0.985 |
| 5.281017250684253 | 0.585 | 0.548 | 0.982 |
| 5.284158843337843 | 0.586 | 0.547 | 0.98 |
| 5.287300435991432 | 0.587 | 0.546 | 0.977 |
| 5.290442028645022 | 0.588 | 0.544 | 0.974 |
| 5.293583621298612 | 0.589 | 0.543 | 0.971 |
| 5.296725213952201 | 0.59 | 0.541 | 0.968 |
| 5.299866806605791 | 0.591 | 0.54 | 0.965 |
| 5.30300839925938 | 0.592 | 0.539 | 0.962 |
| 5.30614999191297 | 0.593 | 0.538 | 0.958 |
| 5.30929158456656 | 0.594 | 0.536 | 0.955 |
| 5.312433177220149 | 0.595 | 0.535 | 0.951 |
| 5.315574769873739 | 0.596 | 0.534 | 0.947 |
| 5.318716362527328 | 0.597 | 0.533 | 0.943 |
| 5.321857955180918 | 0.598 | 0.532 | 0.939 |
| 5.324999547834508 | 0.599 | 0.53 | 0.935 |
| 5.328141140488097 | 0.6 | 0.529 | 0.931 |
| 5.331282733141686 | 0.601 | 0.528 | 0.926 |
| 5.334424325795276 | 0.602 | 0.527 | 0.922 |
| 5.337565918448866 | 0.603 | 0.526 | 0.917 |
| 5.340707511102456 | 0.604 | 0.525 | 0.913 |
| 5.343849103756045 | 0.606 | 0.524 | 0.908 |
| 5.346990696409634 | 0.607 | 0.523 | 0.903 |
| 5.350132289063224 | 0.608 | 0.522 | 0.899 |
| 5.353273881716814 | 0.609 | 0.521 | 0.894 |
| 5.356415474370403 | 0.61 | 0.52 | 0.889 |
| 5.359557067023993 | 0.611 | 0.519 | 0.884 |
| 5.362698659677583 | 0.612 | 0.518 | 0.879 |
| 5.365840252331172 | 0.613 | 0.518 | 0.874 |
| 5.368981844984762 | 0.614 | 0.517 | 0.869 |
| 5.372123437638351 | 0.616 | 0.516 | 0.864 |
| 5.375265030291941 | 0.617 | 0.515 | 0.859 |
| 5.378406622945531 | 0.618 | 0.514 | 0.853 |
| 5.38154821559912 | 0.619 | 0.514 | 0.848 |
| 5.38468980825271 | 0.62 | 0.513 | 0.843 |
| 5.387831400906299 | 0.621 | 0.512 | 0.838 |
| 5.39097299355989 | 0.623 | 0.511 | 0.833 |
| 5.394114586213479 | 0.624 | 0.511 | 0.827 |
| 5.397256178867068 | 0.625 | 0.51 | 0.822 |
| 5.400397771520657 | 0.626 | 0.51 | 0.817 |
| 5.403539364174247 | 0.627 | 0.509 | 0.812 |
| 5.406680956827837 | 0.629 | 0.508 | 0.806 |
| 5.409822549481426 | 0.63 | 0.508 | 0.801 |
| 5.412964142135016 | 0.631 | 0.507 | 0.796 |
| 5.416105734788605 | 0.632 | 0.507 | 0.791 |
| 5.419247327442195 | 0.634 | 0.506 | 0.786 |
| 5.422388920095785 | 0.635 | 0.506 | 0.78 |
| 5.425530512749375 | 0.636 | 0.505 | 0.775 |
| 5.428672105402964 | 0.637 | 0.505 | 0.77 |
| 5.431813698056554 | 0.639 | 0.504 | 0.765 |
| 5.434955290710143 | 0.64 | 0.504 | 0.76 |
| 5.438096883363733 | 0.641 | 0.504 | 0.755 |
| 5.441238476017322 | 0.642 | 0.503 | 0.75 |
| 5.444380068670912 | 0.644 | 0.503 | 0.745 |
| 5.447521661324502 | 0.645 | 0.503 | 0.74 |
| 5.450663253978091 | 0.646 | 0.502 | 0.735 |
| 5.453804846631681 | 0.648 | 0.502 | 0.73 |
| 5.456946439285271 | 0.649 | 0.502 | 0.725 |
| 5.46008803193886 | 0.65 | 0.501 | 0.721 |
| 5.46322962459245 | 0.652 | 0.501 | 0.716 |
| 5.466371217246039 | 0.653 | 0.501 | 0.711 |
| 5.46951280989963 | 0.654 | 0.501 | 0.706 |
| 5.472654402553218 | 0.656 | 0.501 | 0.702 |
| 5.475795995206808 | 0.657 | 0.5 | 0.697 |
| 5.478937587860398 | 0.658 | 0.5 | 0.693 |
| 5.482079180513987 | 0.66 | 0.5 | 0.688 |
| 5.485220773167577 | 0.661 | 0.5 | 0.684 |
| 5.488362365821166 | 0.663 | 0.5 | 0.679 |
| 5.491503958474756 | 0.664 | 0.5 | 0.675 |
| 5.494645551128346 | 0.665 | 0.5 | 0.671 |
| 5.497787143781935 | 0.667 | 0.5 | 0.667 |
| 5.500928736435525 | 0.668 | 0.5 | 0.663 |
| 5.504070329089115 | 0.669 | 0.5 | 0.658 |
| 5.507211921742704 | 0.671 | 0.5 | 0.654 |
| 5.510353514396294 | 0.672 | 0.5 | 0.65 |
| 5.513495107049883 | 0.674 | 0.5 | 0.646 |
| 5.516636699703473 | 0.675 | 0.5 | 0.642 |
| 5.519778292357062 | 0.677 | 0.5 | 0.639 |
| 5.522919885010652 | 0.678 | 0.501 | 0.635 |
| 5.526061477664242 | 0.679 | 0.501 | 0.631 |
| 5.529203070317831 | 0.681 | 0.501 | 0.627 |
| 5.532344662971421 | 0.682 | 0.501 | 0.624 |
| 5.535486255625011 | 0.684 | 0.501 | 0.62 |
| 5.5386278482786 | 0.685 | 0.502 | 0.617 |
| 5.54176944093219 | 0.687 | 0.502 | 0.613 |
| 5.544911033585779 | 0.688 | 0.502 | 0.61 |
| 5.54805262623937 | 0.69 | 0.503 | 0.607 |
| 5.551194218892959 | 0.691 | 0.503 | 0.603 |
| 5.554335811546548 | 0.693 | 0.503 | 0.6 |
| 5.557477404200137 | 0.694 | 0.504 | 0.597 |
| 5.560618996853727 | 0.696 | 0.504 | 0.594 |
| 5.563760589507317 | 0.697 | 0.504 | 0.591 |
| 5.566902182160906 | 0.699 | 0.505 | 0.588 |
| 5.570043774814496 | 0.7 | 0.505 | 0.585 |
| 5.573185367468086 | 0.702 | 0.506 | 0.582 |
| 5.576326960121675 | 0.703 | 0.506 | 0.579 |
| 5.579468552775264 | 0.705 | 0.507 | 0.576 |
| 5.582610145428854 | 0.706 | 0.507 | 0.574 |
| 5.585751738082444 | 0.708 | 0.508 | 0.571 |
| 5.588893330736034 | 0.71 | 0.508 | 0.568 |
| 5.592034923389623 | 0.711 | 0.509 | 0.566 |
| 5.595176516043213 | 0.713 | 0.51 | 0.563 |
| 5.598318108696803 | 0.714 | 0.51 | 0.561 |
| 5.601459701350392 | 0.716 | 0.511 | 0.558 |
| 5.604601294003982 | 0.717 | 0.511 | 0.556 |
| 5.607742886657571 | 0.719 | 0.512 | 0.554 |
| 5.610884479311161 | 0.721 | 0.513 | 0.551 |
| 5.61402607196475 | 0.722 | 0.514 | 0.549 |
| 5.61716766461834 | 0.724 | 0.514 | 0.547 |
| 5.62030925727193 | 0.725 | 0.515 | 0.545 |
| 5.623450849925519 | 0.727 | 0.516 | 0.543 |
| 5.626592442579109 | 0.729 | 0.517 | 0.541 |
| 5.629734035232698 | 0.73 | 0.518 | 0.539 |
| 5.632875627886288 | 0.732 | 0.518 | 0.537 |
| 5.636017220539878 | 0.733 | 0.519 | 0.535 |
| 5.639158813193467 | 0.735 | 0.52 | 0.533 |
| 5.642300405847057 | 0.737 | 0.521 | 0.532 |
| 5.645441998500646 | 0.738 | 0.522 | 0.53 |
| 5.648583591154236 | 0.74 | 0.523 | 0.528 |
| 5.651725183807825 | 0.742 | 0.524 | 0.527 |
| 5.654866776461415 | 0.743 | 0.525 | 0.525 |
| 5.658008369115005 | 0.745 | 0.526 | 0.524 |
| 5.661149961768594 | 0.747 | 0.527 | 0.522 |
| 5.664291554422184 | 0.748 | 0.528 | 0.521 |
| 5.667433147075774 | 0.75 | 0.529 | 0.519 |
| 5.670574739729363 | 0.752 | 0.53 | 0.518 |
| 5.673716332382953 | 0.753 | 0.532 | 0.517 |
| 5.676857925036542 | 0.755 | 0.533 | 0.516 |
| 5.679999517690132 | 0.757 | 0.534 | 0.514 |
| 5.683141110343721 | 0.758 | 0.535 | 0.513 |
| 5.686282702997311 | 0.76 | 0.536 | 0.512 |
| 5.689424295650901 | 0.762 | 0.538 | 0.511 |
| 5.69256588830449 | 0.763 | 0.539 | 0.51 |
| 5.69570748095808 | 0.765 | 0.54 | 0.509 |
| 5.69884907361167 | 0.767 | 0.541 | 0.508 |
| 5.701990666265259 | 0.768 | 0.543 | 0.508 |
| 5.705132258918849 | 0.77 | 0.544 | 0.507 |
| 5.708273851572438 | 0.772 | 0.546 | 0.506 |
| 5.711415444226028 | 0.774 | 0.547 | 0.505 |
| 5.714557036879618 | 0.775 | 0.548 | 0.505 |
| 5.717698629533207 | 0.777 | 0.55 | 0.504 |
| 5.720840222186797 | 0.779 | 0.551 | 0.503 |
| 5.723981814840386 | 0.78 | 0.553 | 0.503 |
| 5.727123407493976 | 0.782 | 0.554 | 0.502 |
| 5.730265000147565 | 0.784 | 0.556 | 0.502 |
| 5.733406592801155 | 0.786 | 0.557 | 0.502 |
| 5.736548185454744 | 0.787 | 0.559 | 0.501 |
| 5.739689778108334 | 0.789 | 0.561 | 0.501 |
| 5.742831370761924 | 0.791 | 0.562 | 0.501 |
| 5.745972963415514 | 0.792 | 0.564 | 0.5 |
| 5.749114556069103 | 0.794 | 0.566 | 0.5 |
| 5.752256148722693 | 0.796 | 0.567 | 0.5 |
| 5.755397741376282 | 0.798 | 0.569 | 0.5 |
| 5.758539334029872 | 0.799 | 0.571 | 0.5 |
| 5.761680926683462 | 0.801 | 0.573 | 0.5 |
| 5.764822519337051 | 0.803 | 0.574 | 0.5 |
| 5.767964111990641 | 0.805 | 0.576 | 0.5 |
| 5.77110570464423 | 0.806 | 0.578 | 0.5 |
| 5.77424729729782 | 0.808 | 0.58 | 0.5 |
| 5.77738888995141 | 0.81 | 0.582 | 0.501 |
| 5.780530482605 | 0.812 | 0.584 | 0.501 |
| 5.783672075258588 | 0.813 | 0.586 | 0.501 |
| 5.786813667912178 | 0.815 | 0.588 | 0.502 |
| 5.789955260565768 | 0.817 | 0.59 | 0.502 |
| 5.793096853219358 | 0.819 | 0.592 | 0.503 |
| 5.796238445872947 | 0.82 | 0.594 | 0.503 |
| 5.799380038526537 | 0.822 | 0.596 | 0.504 |
| 5.802521631180126 | 0.824 | 0.598 | 0.504 |
| 5.805663223833715 | 0.826 | 0.6 | 0.505 |
| 5.808804816487306 | 0.827 | 0.602 | 0.505 |
| 5.811946409140895 | 0.829 | 0.604 | 0.506 |
| 5.815088001794485 | 0.831 | 0.607 | 0.507 |
| 5.818229594448074 | 0.833 | 0.609 | 0.508 |
| 5.821371187101663 | 0.834 | 0.611 | 0.509 |
| 5.824512779755254 | 0.836 | 0.613 | 0.51 |
| 5.827654372408843 | 0.838 | 0.616 | 0.51 |
| 5.830795965062433 | 0.84 | 0.618 | 0.511 |
| 5.833937557716022 | 0.841 | 0.62 | 0.513 |
| 5.837079150369612 | 0.843 | 0.623 | 0.514 |
| 5.840220743023201 | 0.845 | 0.625 | 0.515 |
| 5.843362335676791 | 0.847 | 0.627 | 0.516 |
| 5.846503928330381 | 0.848 | 0.63 | 0.517 |
| 5.84964552098397 | 0.85 | 0.632 | 0.518 |
| 5.85278711363756 | 0.852 | 0.635 | 0.52 |
| 5.85592870629115 | 0.853 | 0.637 | 0.521 |
| 5.85907029894474 | 0.855 | 0.64 | 0.523 |
| 5.862211891598329 | 0.857 | 0.642 | 0.524 |
| 5.865353484251918 | 0.859 | 0.645 | 0.526 |
| 5.868495076905508 | 0.86 | 0.648 | 0.527 |
| 5.871636669559098 | 0.862 | 0.65 | 0.529 |
| 5.874778262212687 | 0.864 | 0.653 | 0.53 |
| 5.877919854866277 | 0.865 | 0.656 | 0.532 |
| 5.881061447519866 | 0.867 | 0.658 | 0.534 |
| 5.884203040173456 | 0.869 | 0.661 | 0.536 |
| 5.887344632827046 | 0.871 | 0.664 | 0.538 |
| 5.890486225480635 | 0.872 | 0.667 | 0.54 |
| 5.893627818134224 | 0.874 | 0.669 | 0.541 |
| 5.896769410787814 | 0.876 | 0.672 | 0.543 |
| 5.899911003441404 | 0.877 | 0.675 | 0.546 |
| 5.903052596094994 | 0.879 | 0.678 | 0.548 |
| 5.906194188748583 | 0.881 | 0.681 | 0.55 |
| 5.909335781402172 | 0.882 | 0.684 | 0.552 |
| 5.912477374055762 | 0.884 | 0.687 | 0.554 |
| 5.915618966709352 | 0.886 | 0.69 | 0.557 |
| 5.918760559362942 | 0.887 | 0.693 | 0.559 |
| 5.921902152016531 | 0.889 | 0.696 | 0.561 |
| 5.92504374467012 | 0.891 | 0.699 | 0.564 |
| 5.92818533732371 | 0.892 | 0.702 | 0.566 |
| 5.9313269299773 | 0.894 | 0.705 | 0.569 |
| 5.93446852263089 | 0.895 | 0.708 | 0.572 |
| 5.93761011528448 | 0.897 | 0.711 | 0.574 |
| 5.940751707938068 | 0.899 | 0.714 | 0.577 |
| 5.943893300591658 | 0.9 | 0.717 | 0.58 |
| 5.947034893245248 | 0.902 | 0.721 | 0.583 |
| 5.950176485898837 | 0.903 | 0.724 | 0.586 |
| 5.953318078552427 | 0.905 | 0.727 | 0.589 |
| 5.956459671206017 | 0.907 | 0.73 | 0.592 |
| 5.959601263859606 | 0.908 | 0.733 | 0.595 |
| 5.962742856513196 | 0.91 | 0.737 | 0.598 |
| 5.965884449166785 | 0.911 | 0.74 | 0.601 |
| 5.969026041820375 | 0.913 | 0.743 | 0.604 |
| 5.972167634473964 | 0.914 | 0.747 | 0.608 |
| 5.975309227127554 | 0.916 | 0.75 | 0.611 |
| 5.978450819781144 | 0.917 | 0.753 | 0.614 |
| 5.981592412434733 | 0.919 | 0.757 | 0.618 |
| 5.984734005088323 | 0.92 | 0.76 | 0.621 |
| 5.987875597741913 | 0.922 | 0.763 | 0.625 |
| 5.991017190395502 | 0.923 | 0.767 | 0.629 |
| 5.994158783049092 | 0.925 | 0.77 | 0.632 |
| 5.997300375702681 | 0.926 | 0.774 | 0.636 |
| 6.000441968356271 | 0.928 | 0.777 | 0.64 |
| 6.003583561009861 | 0.929 | 0.78 | 0.644 |
| 6.00672515366345 | 0.931 | 0.784 | 0.648 |
| 6.00986674631704 | 0.932 | 0.787 | 0.652 |
| 6.01300833897063 | 0.934 | 0.791 | 0.656 |
| 6.01614993162422 | 0.935 | 0.794 | 0.66 |
| 6.019291524277808 | 0.936 | 0.798 | 0.664 |
| 6.022433116931398 | 0.938 | 0.801 | 0.668 |
| 6.025574709584988 | 0.939 | 0.805 | 0.672 |
| 6.028716302238577 | 0.94 | 0.808 | 0.677 |
| 6.031857894892167 | 0.942 | 0.812 | 0.681 |
| 6.034999487545757 | 0.943 | 0.815 | 0.685 |
| 6.038141080199346 | 0.944 | 0.819 | 0.69 |
| 6.041282672852935 | 0.946 | 0.822 | 0.694 |
| 6.044424265506525 | 0.947 | 0.826 | 0.699 |
| 6.047565858160115 | 0.948 | 0.829 | 0.703 |
| 6.050707450813704 | 0.95 | 0.833 | 0.708 |
| 6.053849043467294 | 0.951 | 0.836 | 0.713 |
| 6.056990636120884 | 0.952 | 0.84 | 0.717 |
| 6.060132228774473 | 0.953 | 0.843 | 0.722 |
| 6.063273821428063 | 0.955 | 0.847 | 0.727 |
| 6.066415414081653 | 0.956 | 0.85 | 0.732 |
| 6.069557006735242 | 0.957 | 0.853 | 0.737 |
| 6.072698599388831 | 0.958 | 0.857 | 0.742 |
| 6.07584019204242 | 0.959 | 0.86 | 0.747 |
| 6.078981784696011 | 0.961 | 0.864 | 0.752 |
| 6.082123377349601 | 0.962 | 0.867 | 0.757 |
| 6.08526497000319 | 0.963 | 0.871 | 0.762 |
| 6.08840656265678 | 0.964 | 0.874 | 0.767 |
| 6.09154815531037 | 0.965 | 0.877 | 0.772 |
| 6.094689747963959 | 0.966 | 0.881 | 0.777 |
| 6.097831340617549 | 0.967 | 0.884 | 0.782 |
| 6.100972933271138 | 0.968 | 0.887 | 0.787 |
| 6.104114525924728 | 0.969 | 0.891 | 0.792 |
| 6.107256118578317 | 0.97 | 0.894 | 0.798 |
| 6.110397711231907 | 0.971 | 0.897 | 0.803 |
| 6.113539303885497 | 0.972 | 0.9 | 0.808 |
| 6.116680896539086 | 0.973 | 0.903 | 0.813 |
| 6.119822489192675 | 0.974 | 0.907 | 0.819 |
| 6.122964081846265 | 0.975 | 0.91 | 0.824 |
| 6.126105674499855 | 0.976 | 0.913 | 0.829 |
| 6.129247267153445 | 0.977 | 0.916 | 0.834 |
| 6.132388859807034 | 0.978 | 0.919 | 0.84 |
| 6.135530452460624 | 0.979 | 0.922 | 0.845 |
| 6.138672045114213 | 0.98 | 0.925 | 0.85 |
| 6.141813637767803 | 0.981 | 0.928 | 0.855 |
| 6.144955230421393 | 0.981 | 0.931 | 0.86 |
| 6.148096823074982 | 0.982 | 0.934 | 0.865 |
| 6.151238415728571 | 0.983 | 0.936 | 0.871 |
| 6.154380008382161 | 0.984 | 0.939 | 0.876 |
| 6.157521601035751 | 0.985 | 0.942 | 0.881 |
| 6.16066319368934 | 0.985 | 0.944 | 0.886 |
| 6.16380478634293 | 0.986 | 0.947 | 0.891 |
| 6.16694637899652 | 0.987 | 0.95 | 0.895 |
| 6.170087971650109 | 0.987 | 0.952 | 0.9 |
| 6.173229564303698 | 0.988 | 0.955 | 0.905 |
| 6.176371156957289 | 0.989 | 0.957 | 0.91 |
| 6.179512749610878 | 0.989 | 0.959 | 0.914 |
| 6.182654342264468 | 0.99 | 0.962 | 0.919 |
| 6.185795934918057 | 0.991 | 0.964 | 0.923 |
| 6.188937527571647 | 0.991 | 0.966 | 0.928 |
| 6.192079120225237 | 0.992 | 0.968 | 0.932 |
| 6.195220712878826 | 0.992 | 0.97 | 0.936 |
| 6.198362305532415 | 0.993 | 0.972 | 0.94 |
| 6.201503898186005 | 0.993 | 0.974 | 0.944 |
| 6.204645490839594 | 0.994 | 0.976 | 0.948 |
| 6.207787083493184 | 0.994 | 0.978 | 0.952 |
| 6.210928676146774 | 0.995 | 0.98 | 0.956 |
| 6.214070268800364 | 0.995 | 0.981 | 0.959 |
| 6.217211861453953 | 0.996 | 0.983 | 0.963 |
| 6.220353454107543 | 0.996 | 0.985 | 0.966 |
| 6.223495046761133 | 0.996 | 0.986 | 0.969 |
| 6.226636639414722 | 0.997 | 0.987 | 0.972 |
| 6.229778232068312 | 0.997 | 0.989 | 0.975 |
| 6.232919824721901 | 0.997 | 0.99 | 0.978 |
| 6.236061417375491 | 0.998 | 0.991 | 0.981 |
| 6.23920301002908 | 0.998 | 0.992 | 0.983 |
| 6.24234460268267 | 0.998 | 0.993 | 0.985 |
| 6.24548619533626 | 0.999 | 0.994 | 0.987 |
| 6.24862778798985 | 0.999 | 0.995 | 0.989 |
| 6.251769380643438 | 0.999 | 0.996 | 0.991 |
| 6.254910973297028 | 0.999 | 0.997 | 0.993 |
| 6.258052565950618 | 0.999 | 0.997 | 0.994 |
| 6.261194158604208 | 1 | 0.998 | 0.996 |
| 6.264335751257797 | 1 | 0.999 | 0.997 |
| 6.267477343911387 | 1 | 0.999 | 0.998 |
| 6.270618936564976 | 1 | 0.999 | 0.999 |
| 6.273760529218566 | 1 | 1 | 0.999 |
| 6.276902121872155 | 1 | 1 | 1 |
| 6.280043714525745 | 1 | 1 | 1 |
| 6.283185307179335 | 1 | 1 | 1 |